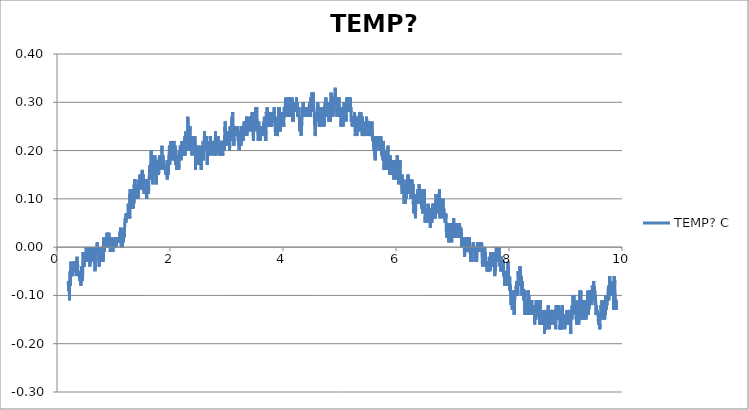
| Category | TEMP? C |
|---|---|
| 0.19886693011111112 | -0.07 |
| 0.20192682733333334 | -0.08 |
| 0.2049870023611111 | -0.09 |
| 0.20804745519444443 | -0.09 |
| 0.21110679683333333 | -0.09 |
| 0.21416724966666667 | -0.08 |
| 0.21722742469444445 | -0.07 |
| 0.22028732194444445 | -0.11 |
| 0.2233469413888889 | -0.08 |
| 0.22641044994444443 | -0.08 |
| 0.2294700693888889 | -0.06 |
| 0.23253246677777778 | -0.05 |
| 0.23559180841666666 | -0.08 |
| 0.23865226125 | -0.07 |
| 0.24171354744444443 | -0.07 |
| 0.24477511144444444 | -0.05 |
| 0.24783528647222222 | -0.03 |
| 0.2508951837222222 | -0.06 |
| 0.25395452536111107 | -0.06 |
| 0.2570135892222222 | -0.05 |
| 0.26007320866666667 | -0.05 |
| 0.2631325503333333 | -0.04 |
| 0.2661943921111111 | -0.05 |
| 0.2692537337777778 | -0.06 |
| 0.27231390880555556 | -0.06 |
| 0.27537352825 | -0.06 |
| 0.27843314769444444 | -0.05 |
| 0.2814924893333334 | -0.05 |
| 0.28455266438888893 | -0.04 |
| 0.2876125616111111 | -0.04 |
| 0.2906719032777778 | -0.04 |
| 0.2937318005 | -0.05 |
| 0.2967911421666667 | -0.05 |
| 0.29985048380555557 | -0.03 |
| 0.30291065883333335 | -0.05 |
| 0.30596972269444445 | -0.05 |
| 0.30902934213888894 | -0.04 |
| 0.31208951716666666 | -0.04 |
| 0.31514997 | -0.03 |
| 0.31820931163888894 | -0.03 |
| 0.32126948666666666 | -0.04 |
| 0.3243310506666667 | -0.05 |
| 0.32739039233333334 | -0.05 |
| 0.3304508451666667 | -0.04 |
| 0.33351018680555555 | -0.04 |
| 0.33657036183333333 | -0.05 |
| 0.33963025908333333 | -0.06 |
| 0.34269015630555555 | -0.04 |
| 0.3457494979722222 | -0.05 |
| 0.3488088396111111 | -0.05 |
| 0.3518684590555555 | -0.04 |
| 0.35493113425 | -0.02 |
| 0.3579918648611111 | -0.04 |
| 0.36105454002777776 | -0.03 |
| 0.3641138816944445 | -0.03 |
| 0.3671729455277778 | -0.04 |
| 0.37023423175 | -0.05 |
| 0.37329412897222225 | -0.05 |
| 0.3763543040277778 | -0.05 |
| 0.3794139234722222 | -0.05 |
| 0.3824732651111111 | -0.06 |
| 0.3855326067777778 | -0.06 |
| 0.3885922262222222 | -0.06 |
| 0.3916543458055555 | -0.06 |
| 0.3947172987777778 | -0.05 |
| 0.397777196 | -0.07 |
| 0.40083653766666666 | -0.07 |
| 0.40389671269444444 | -0.06 |
| 0.4069560543333333 | -0.07 |
| 0.41001595158333337 | -0.07 |
| 0.41307557102777775 | -0.05 |
| 0.4161349126666667 | -0.07 |
| 0.4191942543333333 | -0.07 |
| 0.42225359597222223 | -0.08 |
| 0.42531265983333333 | -0.08 |
| 0.4283728348611111 | -0.07 |
| 0.4314321765 | -0.05 |
| 0.4344929071388889 | -0.06 |
| 0.43755363774999995 | -0.04 |
| 0.44061325719444444 | -0.06 |
| 0.4436725988611111 | -0.05 |
| 0.4467333294722222 | -0.06 |
| 0.44979406008333334 | -0.07 |
| 0.45285673525 | -0.06 |
| 0.4559188548611111 | -0.05 |
| 0.45897847430555555 | -0.02 |
| 0.4620375381388889 | -0.01 |
| 0.4650977131944445 | -0.03 |
| 0.4681570548333333 | -0.04 |
| 0.4712166742777778 | -0.04 |
| 0.4742760159166667 | -0.03 |
| 0.47733702433333336 | -0.02 |
| 0.4803966437777778 | -0.04 |
| 0.4834557076388889 | -0.03 |
| 0.48651643827777774 | -0.03 |
| 0.48957605772222224 | -0.02 |
| 0.49263845508333337 | -0.03 |
| 0.49569779675000003 | -0.02 |
| 0.49875797177777775 | -0.02 |
| 0.501818424611111 | -0.02 |
| 0.5048774884444445 | -0.01 |
| 0.5079371078888889 | -0.03 |
| 0.5109967273333333 | -0.01 |
| 0.5140594025277777 | 0 |
| 0.5171195775555556 | 0 |
| 0.5201805859722223 | 0 |
| 0.5232404831944444 | 0 |
| 0.5263006582222222 | 0 |
| 0.5293650001666667 | -0.01 |
| 0.5324243418333333 | 0 |
| 0.5354839612777778 | 0 |
| 0.5385474698333333 | -0.03 |
| 0.5416334796666666 | -0.02 |
| 0.5446992105833334 | -0.02 |
| 0.5477854982222222 | -0.01 |
| 0.5508506735277778 | -0.03 |
| 0.5539430726388889 | -0.02 |
| 0.5570313048055556 | -0.01 |
| 0.5601245373055556 | 0 |
| 0.5631924905555555 | -0.02 |
| 0.5662665552777778 | -0.02 |
| 0.5693325639722222 | -0.01 |
| 0.5724041285277778 | -0.02 |
| 0.5755012501388889 | -0.02 |
| 0.5785925380555555 | -0.02 |
| 0.581674381 | -0.04 |
| 0.5847562239166666 | -0.02 |
| 0.5878377890833334 | 0 |
| 0.5909654679722222 | -0.02 |
| 0.5940453663333334 | -0.02 |
| 0.597158044388889 | -0.02 |
| 0.6002546103888888 | -0.02 |
| 0.6033367311111111 | -0.02 |
| 0.6063974617222222 | -0.01 |
| 0.6094598591111111 | -0.02 |
| 0.6125272567777778 | -0.02 |
| 0.6155924321111111 | -0.03 |
| 0.6186576074166666 | 0 |
| 0.6217266718611111 | -0.03 |
| 0.6248374053333334 | -0.03 |
| 0.6279003583055556 | -0.03 |
| 0.6309955353333333 | -0.03 |
| 0.6340801561944444 | -0.01 |
| 0.6371822780833333 | -0.02 |
| 0.6402649543888889 | -0.02 |
| 0.6433506864444444 | -0.02 |
| 0.6464211398333334 | -0.02 |
| 0.6494815926666667 | 0 |
| 0.6525448234444444 | 0 |
| 0.65563694475 | -0.01 |
| 0.6587329551388889 | -0.02 |
| 0.6618220207222223 | -0.02 |
| 0.664922753638889 | -0.02 |
| 0.6680304313888888 | -0.02 |
| 0.6711247750277778 | -0.02 |
| 0.6742055068055556 | -0.05 |
| 0.6773212405555556 | -0.02 |
| 0.6803928051388889 | -0.01 |
| 0.6834729813055554 | 0 |
| 0.6865473238333334 | 0 |
| 0.6896636131666667 | -0.01 |
| 0.6927585124166666 | -0.01 |
| 0.6958481335833334 | -0.01 |
| 0.6989230316666667 | 0 |
| 0.7020212644444443 | 0 |
| 0.7051172748611111 | -0.01 |
| 0.7082357865555555 | 0 |
| 0.7113220741944445 | 0.01 |
| 0.7144289185555556 | 0 |
| 0.717515484 | 0 |
| 0.720592326638889 | 0 |
| 0.7236666691388889 | -0.01 |
| 0.7267937924444444 | -0.01 |
| 0.7298784133333334 | -0.02 |
| 0.7329619230277777 | -0.02 |
| 0.7360540443333333 | -0.01 |
| 0.7391319981666667 | -0.02 |
| 0.7422268973888889 | -0.03 |
| 0.7453473536666667 | -0.01 |
| 0.7484591983055555 | -0.04 |
| 0.7515479860833333 | -0.02 |
| 0.75462010625 | 0 |
| 0.7576966711111112 | -0.02 |
| 0.7608229610277778 | -0.01 |
| 0.7639236939444445 | 0 |
| 0.7670022033611111 | -0.02 |
| 0.7701018250833334 | -0.01 |
| 0.773185057 | 0 |
| 0.7762805118333332 | -0.01 |
| 0.7793515208055556 | -0.02 |
| 0.7824464200555555 | -0.01 |
| 0.7855154844722222 | -0.02 |
| 0.7885989941666667 | -0.02 |
| 0.7917122278055556 | -0.02 |
| 0.7947790698888889 | -0.03 |
| 0.7978761914722222 | -0.02 |
| 0.8009730352777777 | -0.03 |
| 0.8040490445277778 | -0.01 |
| 0.8071425548055555 | -0.03 |
| 0.8102277312777778 | 0 |
| 0.8133287419722222 | -0.02 |
| 0.816398362 | -0.03 |
| 0.8195374304166666 | 0 |
| 0.8226112173333334 | 0 |
| 0.8257288956666666 | 0.02 |
| 0.8288093496388889 | 0.02 |
| 0.8318917481666667 | 0 |
| 0.8349780358055555 | 0 |
| 0.8380757129722223 | -0.01 |
| 0.8411572781111112 | 0 |
| 0.8442496772222222 | 0 |
| 0.8473142969444445 | 0 |
| 0.8504305863055556 | 0.01 |
| 0.8534943726388889 | 0 |
| 0.8565814936666667 | 0 |
| 0.859668336888889 | 0.02 |
| 0.8627351789722223 | 0.02 |
| 0.8658550796388889 | 0.01 |
| 0.8689772026666667 | 0.02 |
| 0.8720890473055556 | 0.02 |
| 0.8752347828055554 | 0.01 |
| 0.8783266263055556 | 0.02 |
| 0.8814123583611111 | 0.02 |
| 0.8845005905555556 | 0.03 |
| 0.8875957675833334 | 0.03 |
| 0.890686222111111 | 0.03 |
| 0.8938089007222223 | 0.02 |
| 0.8968807430833333 | 0.01 |
| 0.8999498075277778 | 0 |
| 0.9030394286944444 | 0.01 |
| 0.9061582181666666 | 0 |
| 0.9092264492222223 | 0.02 |
| 0.9123082921666668 | 0 |
| 0.9154143031388888 | 0.02 |
| 0.9184883678611111 | 0.03 |
| 0.9215885451944444 | 0 |
| 0.9246912226388888 | 0.02 |
| 0.9277980670277778 | 0 |
| 0.930886577 | 0.02 |
| 0.9339914768055555 | 0.01 |
| 0.9371174889444444 | 0.02 |
| 0.9402112770000001 | 0 |
| 0.9433014537500001 | -0.01 |
| 0.9463766296388889 | 0 |
| 0.9494776403611112 | 0 |
| 0.9525483715555556 | 0 |
| 0.955660494 | 0 |
| 0.9587395590000001 | 0 |
| 0.9618450143888889 | 0 |
| 0.9649507475833333 | 0.02 |
| 0.9680978720277779 | 0.01 |
| 0.9711733257222221 | 0 |
| 0.9742793366944444 | -0.01 |
| 0.9773822919722222 | 0 |
| 0.9804944144166667 | 0 |
| 0.9835754239722222 | 0 |
| 0.9866461551666666 | 0 |
| 0.9897507771666667 | -0.01 |
| 0.992830953361111 | 0.01 |
| 0.9959241858333333 | 0 |
| 0.9990243631388889 | 0.01 |
| 1.00214704175 | 0.01 |
| 1.0052249955833332 | 0 |
| 1.00830517175 | 0 |
| 1.0113995154166666 | 0 |
| 1.0144983037777777 | 0.01 |
| 1.017640705722222 | 0 |
| 1.0207289379166666 | 0.02 |
| 1.0238666173888888 | 0 |
| 1.0269320705 | 0 |
| 1.0300378036944444 | 0 |
| 1.033111035027778 | 0 |
| 1.0361870442777779 | 0 |
| 1.0392491638888888 | 0 |
| 1.0423451743055556 | 0.01 |
| 1.0454497963055556 | 0 |
| 1.0485480290833333 | 0 |
| 1.0516265384999999 | 0 |
| 1.0547056035 | 0 |
| 1.0577927245 | 0.01 |
| 1.0608792899444444 | 0.02 |
| 1.063965022 | 0.01 |
| 1.0670271415833332 | 0.02 |
| 1.0701225964166665 | 0.01 |
| 1.0732069394722223 | 0.02 |
| 1.0762746149444444 | 0.02 |
| 1.0793378457222222 | 0.01 |
| 1.0824399675833334 | 0.01 |
| 1.0855276441944444 | 0.01 |
| 1.0886089315277778 | 0.02 |
| 1.0916713289166666 | 0.02 |
| 1.0947462270277777 | 0.01 |
| 1.0978136246944443 | 0.02 |
| 1.1008932452777778 | 0.02 |
| 1.1039684211666667 | 0.01 |
| 1.1070508196944444 | 0.01 |
| 1.1101315514444443 | 0.01 |
| 1.1132233949722223 | 0.02 |
| 1.1163016265833334 | 0.03 |
| 1.119371246611111 | 0.01 |
| 1.1224542007222222 | 0.04 |
| 1.1255313211666667 | 0.03 |
| 1.12861094175 | 0.02 |
| 1.1316802839722222 | 0.02 |
| 1.1347565710277778 | 0.01 |
| 1.1378181350277776 | 0 |
| 1.140880254611111 | 0.02 |
| 1.1439593196111113 | 0.02 |
| 1.147035051111111 | 0.01 |
| 1.1501207831388889 | 0.01 |
| 1.1531845695 | 0.02 |
| 1.1562569674444445 | 0 |
| 1.1593379769999999 | 0.02 |
| 1.1624320428611112 | 0.01 |
| 1.1655238863888888 | 0.03 |
| 1.1686096184166668 | 0.01 |
| 1.1717100735555555 | 0.01 |
| 1.1747805269444445 | 0.01 |
| 1.1778790375 | 0.02 |
| 1.1809906043611111 | 0.03 |
| 1.1840630023055556 | 0.04 |
| 1.187181236222222 | 0.02 |
| 1.1902728019444446 | 0.03 |
| 1.193349922388889 | 0.03 |
| 1.1964442660277779 | 0.04 |
| 1.1995169417777778 | 0.05 |
| 1.202609340888889 | 0.05 |
| 1.205674794 | 0.05 |
| 1.2087869164444445 | 0.06 |
| 1.2118723706944443 | 0.05 |
| 1.2149878266666665 | 0.06 |
| 1.2180688362222223 | 0.05 |
| 1.221159846361111 | 0.05 |
| 1.2242277996111113 | 0.07 |
| 1.2273135316666668 | 0.06 |
| 1.230384540638889 | 0.06 |
| 1.2334727728333335 | 0.06 |
| 1.2365646163333335 | 0.06 |
| 1.2396409034166667 | 0.06 |
| 1.2427574705555555 | 0.07 |
| 1.2458301463055554 | 0.07 |
| 1.2489411575833334 | 0.07 |
| 1.2520318899166667 | 0.06 |
| 1.2551540129166667 | 0.07 |
| 1.2582291888333335 | 0.07 |
| 1.261331032888889 | 0.09 |
| 1.2644112090833333 | 0.08 |
| 1.2674958299444445 | 0.08 |
| 1.2705651721666666 | 0.07 |
| 1.2736620159722223 | 0.07 |
| 1.2767280246666666 | 0.06 |
| 1.2798040339444443 | 0.07 |
| 1.2829222678611112 | 0.08 |
| 1.2860082776944446 | 0.06 |
| 1.2890842869722223 | 0.11 |
| 1.2921594628611113 | 0.08 |
| 1.2952726964722223 | 0.12 |
| 1.298343149861111 | 0.09 |
| 1.3014672174444444 | 0.08 |
| 1.3045429489166667 | 0.09 |
| 1.3076245140833334 | 0.09 |
| 1.3107460815 | 0.1 |
| 1.3138470921944445 | 0.09 |
| 1.3169714375833335 | 0.12 |
| 1.320040502 | 0.1 |
| 1.3231429016666667 | 0.09 |
| 1.3262311338611112 | 0.08 |
| 1.3293377004444444 | 0.09 |
| 1.332435377611111 | 0.11 |
| 1.3355527781388887 | 0.11 |
| 1.3386176756666666 | 0.09 |
| 1.3417203531388888 | 0.11 |
| 1.344793584472222 | 0.08 |
| 1.3478798721111112 | 0.09 |
| 1.3509781048611111 | 0.1 |
| 1.3540666148611111 | 0.12 |
| 1.3571706812777777 | 0.11 |
| 1.3602366899722222 | 0.09 |
| 1.3633360339166665 | 0.11 |
| 1.3664256550833334 | 0.13 |
| 1.3694986086111112 | 0.11 |
| 1.3725937856666666 | 0.14 |
| 1.3756906294444444 | 0.12 |
| 1.3787710834166667 | 0.14 |
| 1.3818587600277779 | 0.1 |
| 1.3849650488055556 | 0.11 |
| 1.388047725138889 | 0.12 |
| 1.3911151228055556 | 0.11 |
| 1.394288359861111 | 0.13 |
| 1.3973793699722223 | 0.12 |
| 1.4004445453055556 | 0.11 |
| 1.4035316663055555 | 0.1 |
| 1.4066210096666667 | 0.11 |
| 1.4096884073611111 | 0.13 |
| 1.4127824731944445 | 0.12 |
| 1.4158532043888887 | 0.13 |
| 1.418921157638889 | 0.11 |
| 1.4220007782500002 | 0.11 |
| 1.425072065027778 | 0.12 |
| 1.4281464075277779 | 0.11 |
| 1.431253251888889 | 0.12 |
| 1.4343262054444443 | 0.11 |
| 1.4374024925000002 | 0.1 |
| 1.440478223972222 | 0.13 |
| 1.4435742343888889 | 0.12 |
| 1.4466644111388889 | 0.13 |
| 1.44974264275 | 0.14 |
| 1.452838375388889 | 0.13 |
| 1.455916607 | 0.12 |
| 1.4590467860277778 | 0.13 |
| 1.4621330736666667 | 0.13 |
| 1.465206305 | 0.15 |
| 1.4682934260277776 | 0.14 |
| 1.4713852695277778 | 0.14 |
| 1.4744832245000001 | 0.14 |
| 1.4775917356388888 | 0.12 |
| 1.4806799678333333 | 0.15 |
| 1.483746532111111 | 0.13 |
| 1.4868439315000002 | 0.15 |
| 1.4899341082500002 | 0.15 |
| 1.4930653984722222 | 0.13 |
| 1.4961619644722222 | 0.12 |
| 1.4992382515277778 | 0.12 |
| 1.5023100938888887 | 0.15 |
| 1.5054116601944445 | 0.14 |
| 1.5085021147222222 | 0.16 |
| 1.5115950694166669 | 0.15 |
| 1.5147141366944445 | 0.14 |
| 1.5178090359444445 | 0.13 |
| 1.5208731000833333 | 0.15 |
| 1.5239343862777777 | 0.15 |
| 1.5270276187777778 | 0.13 |
| 1.5301055725833335 | 0.15 |
| 1.5331907490555556 | 0.13 |
| 1.5362659249444444 | 0.13 |
| 1.5393522125833334 | 0.14 |
| 1.5424365556666668 | 0.11 |
| 1.5455278435833333 | 0.13 |
| 1.5486205204722223 | 0.14 |
| 1.5517145863333333 | 0.13 |
| 1.5547972626666668 | 0.14 |
| 1.557897717777778 | 0.14 |
| 1.5609987284722222 | 0.14 |
| 1.5641039060833333 | 0.14 |
| 1.5671899159166667 | 0.12 |
| 1.5702659251944444 | 0.13 |
| 1.5733561019444444 | 0.12 |
| 1.5764282220833332 | 0.12 |
| 1.5794978421111112 | 0.12 |
| 1.58257940725 | 0.12 |
| 1.5856448603611113 | 0.12 |
| 1.5887267033055557 | 0.1 |
| 1.5918143799166666 | 0.13 |
| 1.5949223354444444 | 0.12 |
| 1.5980005670833333 | 0.12 |
| 1.6011054668888889 | 0.14 |
| 1.604198699361111 | 0.11 |
| 1.6072860981666668 | 0.12 |
| 1.6103690522777778 | 0.11 |
| 1.6134550621388888 | 0.14 |
| 1.6165474612222221 | 0.14 |
| 1.6196565279444444 | 0.11 |
| 1.6227519827777777 | 0.12 |
| 1.6258838285833335 | 0.14 |
| 1.6290045626388887 | 0.14 |
| 1.6320983506944446 | 0.14 |
| 1.6352026949166667 | 0.15 |
| 1.6383017610555557 | 0.16 |
| 1.6414197171666667 | 0.16 |
| 1.6444871148333333 | 0.17 |
| 1.6475761804166666 | 0.16 |
| 1.6506596901111112 | 0.14 |
| 1.6537607008055557 | 0.14 |
| 1.6568328209722223 | 0.14 |
| 1.6599304981666667 | 0.17 |
| 1.6630278975277777 | 0.18 |
| 1.666146687027778 | 0.2 |
| 1.6692385305555555 | 0.17 |
| 1.672313428638889 | 0.16 |
| 1.6753886045277777 | 0.16 |
| 1.678481837 | 0.16 |
| 1.6815581240833333 | 0.16 |
| 1.68463830025 | 0.16 |
| 1.6877140317222223 | 0.14 |
| 1.69077892925 | 0.16 |
| 1.6938599388055557 | 0.15 |
| 1.6969259475 | 0.13 |
| 1.7000069570555554 | 0.15 |
| 1.7030707434166668 | 0.15 |
| 1.706159808972222 | 0.16 |
| 1.7092310957777777 | 0.17 |
| 1.7123112719444444 | 0.19 |
| 1.7153917259166667 | 0.19 |
| 1.7184599569722223 | 0.16 |
| 1.721522632138889 | 0.15 |
| 1.7245878074444443 | 0.16 |
| 1.7276524271944445 | 0.17 |
| 1.7307212138055554 | 0.19 |
| 1.733792778388889 | 0.19 |
| 1.7368604538611112 | 0.18 |
| 1.7399556308888888 | 0.16 |
| 1.7430208061944445 | 0.17 |
| 1.74610653825 | 0.17 |
| 1.7491969928055555 | 0.16 |
| 1.7522691129444443 | 0.16 |
| 1.7553515114722222 | 0.15 |
| 1.7584358545555556 | 0.13 |
| 1.7615124194166667 | 0.15 |
| 1.7645925955833335 | 0.18 |
| 1.7676633267777777 | 0.16 |
| 1.7707593371944443 | 0.17 |
| 1.7738392355833335 | 0.16 |
| 1.7769285789444444 | 0.18 |
| 1.7800070883611112 | 0.17 |
| 1.783071985888889 | 0.17 |
| 1.7861354944444443 | 0.15 |
| 1.7892012253611111 | 0.16 |
| 1.7922739010833333 | 0.16 |
| 1.7953504659444444 | 0.16 |
| 1.7984164746666667 | 0.15 |
| 1.8014963730277778 | 0.17 |
| 1.804564881888889 | 0.18 |
| 1.8076428356944443 | 0.18 |
| 1.8107169004166668 | 0.18 |
| 1.81378540925 | 0.19 |
| 1.8168614185277778 | 0.18 |
| 1.8199424280833334 | 0.16 |
| 1.823045383361111 | 0.16 |
| 1.8261122254166666 | 0.17 |
| 1.8291804564722223 | 0.18 |
| 1.8322798004166667 | 0.17 |
| 1.8353630323333332 | 0.18 |
| 1.8384720990277779 | 0.18 |
| 1.8415397745000002 | 0.19 |
| 1.8446002273333335 | 0.17 |
| 1.8476640136666667 | 0.18 |
| 1.8507525236666666 | 0.17 |
| 1.8538276995555556 | 0.18 |
| 1.856894541638889 | 0.21 |
| 1.8599713842777779 | 0.2 |
| 1.8630537828055556 | 0.18 |
| 1.8661431261666666 | 0.16 |
| 1.8692077459166667 | 0.18 |
| 1.8722773659166667 | 0.18 |
| 1.8753539307777778 | 0.19 |
| 1.8784602195555555 | 0.19 |
| 1.8815562299722224 | 0.18 |
| 1.8846269611666666 | 0.17 |
| 1.8877157489444443 | 0.17 |
| 1.8907931471944444 | 0.18 |
| 1.8938961024444443 | 0.16 |
| 1.897002669027778 | 0.17 |
| 1.90008951225 | 0.17 |
| 1.9031671882777779 | 0.17 |
| 1.9062429197500002 | 0.16 |
| 1.9093080950833334 | 0.17 |
| 1.9123896602222223 | 0.16 |
| 1.9154531687777778 | 0.16 |
| 1.9185450122777776 | 0.16 |
| 1.9216160212777778 | 0.16 |
| 1.9246953640555555 | 0.17 |
| 1.9277841518333334 | 0.15 |
| 1.9308807178333334 | 0.17 |
| 1.9339589494722222 | 0.16 |
| 1.9370544042777778 | 0.16 |
| 1.9401304135555557 | 0.17 |
| 1.943241702638889 | 0.16 |
| 1.9463266013055556 | 0.17 |
| 1.949412611138889 | 0.16 |
| 1.9524919539444443 | 0.14 |
| 1.9555671298333333 | 0.18 |
| 1.9586367498333335 | 0.16 |
| 1.9617166482222224 | 0.16 |
| 1.9647865460277778 | 0.18 |
| 1.967851999138889 | 0.16 |
| 1.970927175027778 | 0.15 |
| 1.9740087401666668 | 0.17 |
| 1.9770822493055558 | 0.18 |
| 1.9801527026944445 | 0.17 |
| 1.9832214893333333 | 0.19 |
| 1.9863250001944446 | 0.19 |
| 1.9894007316666666 | 0.21 |
| 1.9924734074166668 | 0.19 |
| 1.9955477499166667 | 0.17 |
| 1.9986232036111111 | 0.17 |
| 2.001713380361111 | 0.21 |
| 2.0048016125555557 | 0.19 |
| 2.0078862334166665 | 0.18 |
| 2.0109577979999997 | 0.2 |
| 2.0140332516666666 | 0.22 |
| 2.017102316111111 | 0.2 |
| 2.0202011044444443 | 0.2 |
| 2.023268502111111 | 0.19 |
| 2.026382569111111 | 0.2 |
| 2.0294613563333335 | 0.21 |
| 2.032544866027778 | 0.21 |
| 2.0356219864722225 | 0.22 |
| 2.038722719388889 | 0.22 |
| 2.0418051179166667 | 0.22 |
| 2.04487834925 | 0.2 |
| 2.0479404688333336 | 0.21 |
| 2.0510250896944444 | 0.2 |
| 2.0540958208888886 | 0.19 |
| 2.0571846086666667 | 0.18 |
| 2.0602761743888887 | 0.19 |
| 2.0633577395277776 | 0.18 |
| 2.0664345821944443 | 0.21 |
| 2.06950281325 | 0.22 |
| 2.072577989138889 | 0.21 |
| 2.0756414976944444 | 0.21 |
| 2.07873528575 | 0.2 |
| 2.081822128972222 | 0.19 |
| 2.0848859153333335 | 0.19 |
| 2.087960257833333 | 0.19 |
| 2.0910265443333333 | 0.21 |
| 2.094113943138889 | 0.18 |
| 2.097188007861111 | 0.2 |
| 2.1002873518055556 | 0.18 |
| 2.1033722504722223 | 0.17 |
| 2.1064477041388887 | 0.18 |
| 2.109523435611111 | 0.18 |
| 2.112586666388889 | 0.17 |
| 2.115672120638889 | 0.18 |
| 2.1187459075555557 | 0.16 |
| 2.121831639611111 | 0.17 |
| 2.1249045931388886 | 0.17 |
| 2.12798421375 | 0.18 |
| 2.1310621675555557 | 0.18 |
| 2.1341523443055554 | 0.19 |
| 2.137246687972222 | 0.19 |
| 2.140361032777778 | 0.19 |
| 2.143458987722222 | 0.18 |
| 2.146523051888889 | 0.19 |
| 2.149596283222222 | 0.19 |
| 2.1527070166944444 | 0.18 |
| 2.155771358638889 | 0.16 |
| 2.1588587574444444 | 0.17 |
| 2.161950045361111 | 0.2 |
| 2.16504744475 | 0.19 |
| 2.1681276209166667 | 0.18 |
| 2.1712241869166666 | 0.2 |
| 2.1742860287222223 | 0.2 |
| 2.1773712051944445 | 0.19 |
| 2.180441380777778 | 0.19 |
| 2.18352655725 | 0.21 |
| 2.1865986774166664 | 0.21 |
| 2.189699965888889 | 0.2 |
| 2.1927704193055555 | 0.21 |
| 2.195841428277778 | 0.2 |
| 2.1989235490277776 | 0.18 |
| 2.2020153925277777 | 0.19 |
| 2.205090290611111 | 0.19 |
| 2.208169633416667 | 0.2 |
| 2.2112439759166667 | 0.22 |
| 2.2143235965277777 | 0.19 |
| 2.2174043282777776 | 0.19 |
| 2.2204922826666667 | 0.21 |
| 2.2235616248888888 | 0.21 |
| 2.22664763475 | 0.21 |
| 2.2297317000277777 | 0.2 |
| 2.232809653861111 | 0.21 |
| 2.2358742735833332 | 0.19 |
| 2.238956672111111 | 0.2 |
| 2.2420221252222223 | 0.22 |
| 2.2450911896666668 | 0.2 |
| 2.2481580317222223 | 0.22 |
| 2.251232652027778 | 0.21 |
| 2.2543147727777777 | 0.22 |
| 2.25738105925 | 0.21 |
| 2.2604573463333333 | 0.22 |
| 2.2635302998611113 | 0.23 |
| 2.266604642361111 | 0.19 |
| 2.2696948191111113 | 0.21 |
| 2.2727724951666666 | 0.23 |
| 2.275835448111111 | 0.23 |
| 2.2789211801666664 | 0.23 |
| 2.2819846887222224 | 0.24 |
| 2.2850612535833332 | 0.24 |
| 2.2881322625833334 | 0.22 |
| 2.2911982712777776 | 0.22 |
| 2.294264002166667 | 0.2 |
| 2.2973625127222226 | 0.21 |
| 2.3004335217222223 | 0.2 |
| 2.3035148090833335 | 0.22 |
| 2.3066019300833336 | 0.21 |
| 2.309665994222222 | 0.22 |
| 2.3127342252777776 | 0.22 |
| 2.3158246798333333 | 0.27 |
| 2.3189101340833336 | 0.27 |
| 2.3219930881944446 | 0.23 |
| 2.3250635415833334 | 0.21 |
| 2.3281717749166666 | 0.21 |
| 2.3312350056944444 | 0.22 |
| 2.334300181 | 0.2 |
| 2.3373834129166666 | 0.22 |
| 2.3404744230277776 | 0.24 |
| 2.343560710666667 | 0.24 |
| 2.346642275833333 | 0.23 |
| 2.349716340527778 | 0.23 |
| 2.35279040525 | 0.25 |
| 2.3558747483333335 | 0.24 |
| 2.3589549245 | 0.22 |
| 2.362031489361111 | 0.23 |
| 2.365106109666667 | 0.23 |
| 2.3681748963055558 | 0.23 |
| 2.3712384048611113 | 0.22 |
| 2.374315803111111 | 0.22 |
| 2.3774045908888892 | 0.23 |
| 2.3804717107499997 | 0.21 |
| 2.383542441944445 | 0.2 |
| 2.3866098396111113 | 0.2 |
| 2.389689738 | 0.19 |
| 2.39279269325 | 0.19 |
| 2.395885092361111 | 0.22 |
| 2.398968046472222 | 0.22 |
| 2.4020598899722225 | 0.21 |
| 2.4051631230277777 | 0.21 |
| 2.4082296873055555 | 0.23 |
| 2.411326531111111 | 0.22 |
| 2.4144219859444447 | 0.21 |
| 2.4175196631111113 | 0.21 |
| 2.4205953945833336 | 0.21 |
| 2.423680848833333 | 0.22 |
| 2.4267610250277776 | 0.23 |
| 2.429846201472222 | 0.21 |
| 2.432918599444444 | 0.22 |
| 2.4360007201666667 | 0.21 |
| 2.439064506527778 | 0.23 |
| 2.4421369044722225 | 0.21 |
| 2.445218469611111 | 0.19 |
| 2.4482917009444445 | 0.21 |
| 2.451372432722222 | 0.16 |
| 2.4544587203333332 | 0.18 |
| 2.4575286181666667 | 0.2 |
| 2.4606421295833334 | 0.18 |
| 2.4637109162222224 | 0.19 |
| 2.466793314722222 | 0.2 |
| 2.4699079373333337 | 0.2 |
| 2.4729972806944445 | 0.2 |
| 2.476090235388889 | 0.2 |
| 2.4792006910555555 | 0.18 |
| 2.482281700611111 | 0.18 |
| 2.4853546541666667 | 0.2 |
| 2.488442052972222 | 0.19 |
| 2.491521673555556 | 0.21 |
| 2.4946196285277775 | 0.21 |
| 2.497694248833333 | 0.2 |
| 2.500762757666667 | 0.19 |
| 2.5038612682222223 | 0.2 |
| 2.5069294992777778 | 0.21 |
| 2.5099955079722225 | 0.17 |
| 2.513065128 | 0.2 |
| 2.516138914916667 | 0.19 |
| 2.5192340919444445 | 0.18 |
| 2.5223234353333335 | 0.18 |
| 2.5253983334166668 | 0.17 |
| 2.528473787111111 | 0.19 |
| 2.5315342399166667 | 0.2 |
| 2.5346016375833336 | 0.18 |
| 2.537677646861111 | 0.19 |
| 2.540761712138889 | 0.18 |
| 2.543851611111111 | 0.17 |
| 2.546930953888889 | 0.17 |
| 2.5500197416666666 | 0.18 |
| 2.5530957509444443 | 0.16 |
| 2.5561764827222224 | 0.18 |
| 2.559242769194445 | 0.19 |
| 2.5623162783333333 | 0.21 |
| 2.5653925653888887 | 0.2 |
| 2.568464963361111 | 0.2 |
| 2.5715548623055553 | 0.21 |
| 2.574622259972222 | 0.21 |
| 2.5777066030555553 | 0.2 |
| 2.5807845568888887 | 0.2 |
| 2.583858343805556 | 0.19 |
| 2.5869468537777776 | 0.18 |
| 2.5900125846944446 | 0.22 |
| 2.5931027614444444 | 0.19 |
| 2.5961809930555555 | 0.18 |
| 2.599263947166667 | 0.2 |
| 2.6023291224999996 | 0.2 |
| 2.605440133777778 | 0.21 |
| 2.6085105871666667 | 0.23 |
| 2.611595208027778 | 0.24 |
| 2.6146639946666665 | 0.21 |
| 2.617758616111111 | 0.22 |
| 2.6208379589166664 | 0.21 |
| 2.6239156349444444 | 0.22 |
| 2.627001367 | 0.21 |
| 2.6300893213888887 | 0.22 |
| 2.6331589414166667 | 0.22 |
| 2.6362530072777774 | 0.22 |
| 2.639313460111111 | 0.2 |
| 2.642395580833333 | 0.21 |
| 2.645461867333333 | 0.23 |
| 2.648534543083333 | 0.21 |
| 2.6516222196666663 | 0.2 |
| 2.6546837836666666 | 0.2 |
| 2.657769237944444 | 0.19 |
| 2.6608508030833335 | 0.17 |
| 2.663943479972222 | 0.21 |
| 2.6670233783611113 | 0.2 |
| 2.670114110694444 | 0.2 |
| 2.673199842722222 | 0.22 |
| 2.676292519638889 | 0.2 |
| 2.6793876966666668 | 0.21 |
| 2.6824753732777777 | 0.22 |
| 2.6855572161944443 | 0.2 |
| 2.688661838222222 | 0.21 |
| 2.6917753496388888 | 0.19 |
| 2.694850247722222 | 0.2 |
| 2.6979207011388886 | 0.21 |
| 2.700987821 | 0.2 |
| 2.7040607745555554 | 0.2 |
| 2.70714900675 | 0.2 |
| 2.710215293222222 | 0.21 |
| 2.713295747194444 | 0.23 |
| 2.716361755888889 | 0.23 |
| 2.719451099277778 | 0.2 |
| 2.7225284975000004 | 0.22 |
| 2.7256053401666667 | 0.22 |
| 2.7286766269444445 | 0.22 |
| 2.7317473581388887 | 0.2 |
| 2.73480808875 | 0.2 |
| 2.7379188222222224 | 0.22 |
| 2.741034833777778 | 0.21 |
| 2.7441433449166666 | 0.19 |
| 2.747219631972222 | 0.2 |
| 2.7502911965555557 | 0.2 |
| 2.7533897071111113 | 0.2 |
| 2.756494884722222 | 0.21 |
| 2.7596000623333334 | 0.21 |
| 2.762694405972222 | 0.21 |
| 2.765764303777778 | 0.2 |
| 2.7688450355555556 | 0.21 |
| 2.7719327121666666 | 0.21 |
| 2.7750340006388887 | 0.22 |
| 2.7781230662222223 | 0.22 |
| 2.7811943529999996 | 0.22 |
| 2.7842770293055557 | 0.2 |
| 2.7873616501944443 | 0.21 |
| 2.7904359926944444 | 0.21 |
| 2.7935606158611113 | 0.2 |
| 2.796669960388889 | 0.19 |
| 2.7997593037499997 | 0.21 |
| 2.802840591083333 | 0.21 |
| 2.8059238229999997 | 0.24 |
| 2.8090178888611113 | 0.22 |
| 2.8120822308055553 | 0.22 |
| 2.8151593512499997 | 0.19 |
| 2.8182378606666663 | 0.2 |
| 2.82132220375 | 0.21 |
| 2.824395990666667 | 0.2 |
| 2.827487556388889 | 0.21 |
| 2.830577455333333 | 0.21 |
| 2.833642352861111 | 0.21 |
| 2.8367197510833333 | 0.2 |
| 2.8398402073611115 | 0.2 |
| 2.842944273777778 | 0.21 |
| 2.846038895222222 | 0.2 |
| 2.8491129599444442 | 0.2 |
| 2.8522325828333335 | 0.21 |
| 2.855305536361111 | 0.23 |
| 2.85839349075 | 0.2 |
| 2.861468388861111 | 0.21 |
| 2.8645980123055557 | 0.2 |
| 2.867671243638889 | 0.22 |
| 2.8707528087777776 | 0.21 |
| 2.8738671535833333 | 0.2 |
| 2.8769628861944447 | 0.21 |
| 2.8800666748333335 | 0.22 |
| 2.88315462925 | 0.19 |
| 2.8862364721666665 | 0.2 |
| 2.88933026025 | 0.19 |
| 2.8924279374166666 | 0.22 |
| 2.895528948111111 | 0.21 |
| 2.898611902222222 | 0.22 |
| 2.901723191305556 | 0.22 |
| 2.9047947558611114 | 0.22 |
| 2.907884654833333 | 0.21 |
| 2.910947052194444 | 0.2 |
| 2.9140480629166667 | 0.21 |
| 2.917143795527778 | 0.2 |
| 2.9202231383333337 | 0.21 |
| 2.923334149611111 | 0.2 |
| 2.9264334935277776 | 0.19 |
| 2.9296003413333334 | 0.2 |
| 2.9326735726666664 | 0.19 |
| 2.935757360166667 | 0.19 |
| 2.9388847612777775 | 0.19 |
| 2.9419866053333332 | 0.22 |
| 2.9450806711944444 | 0.21 |
| 2.9481794595555555 | 0.21 |
| 2.951286026138889 | 0.22 |
| 2.9543725915555554 | 0.21 |
| 2.9574894365 | 0.22 |
| 2.9605829467777776 | 0.21 |
| 2.963699236138889 | 0.2 |
| 2.9667938575833332 | 0.23 |
| 2.969865144361111 | 0.23 |
| 2.972936431138889 | 0.25 |
| 2.9760171628888887 | 0.24 |
| 2.9790837271944444 | 0.26 |
| 2.9821630699722226 | 0.26 |
| 2.985249079805556 | 0.23 |
| 2.9883523128611107 | 0.23 |
| 2.9914224884722223 | 0.23 |
| 2.994539055611111 | 0.24 |
| 2.9976108979722222 | 0.23 |
| 3.0007027414999996 | 0.22 |
| 3.003789029138889 | 0.22 |
| 3.0068608715000003 | 0.22 |
| 3.009936602972222 | 0.21 |
| 3.0130248351666666 | 0.23 |
| 3.0161350130555555 | 0.22 |
| 3.0192338014166666 | 0.23 |
| 3.0223692585277777 | 0.22 |
| 3.025558885416667 | 0.23 |
| 3.028646006416667 | 0.24 |
| 3.0317181265833333 | 0.24 |
| 3.034796358194445 | 0.24 |
| 3.037865700416667 | 0.21 |
| 3.04094365425 | 0.22 |
| 3.044033553222222 | 0.21 |
| 3.0471345639166665 | 0.22 |
| 3.0502722433888887 | 0.23 |
| 3.053368809388889 | 0.2 |
| 3.0564948215 | 0.2 |
| 3.059591109722222 | 0.22 |
| 3.0626548960555557 | 0.25 |
| 3.065742294888889 | 0.24 |
| 3.0688274713333334 | 0.24 |
| 3.0718912576944444 | 0.23 |
| 3.0749694893055555 | 0.24 |
| 3.0780560547499998 | 0.24 |
| 3.0811492872222224 | 0.22 |
| 3.084241130722222 | 0.23 |
| 3.087318251166667 | 0.25 |
| 3.090425928916667 | 0.24 |
| 3.093496660111111 | 0.26 |
| 3.09656378 | 0.27 |
| 3.099644233972222 | 0.25 |
| 3.10274107775 | 0.25 |
| 3.105811253361111 | 0.25 |
| 3.1089111528888886 | 0.28 |
| 3.1119921624444444 | 0.27 |
| 3.115104840472222 | 0.27 |
| 3.1181805719444444 | 0.25 |
| 3.1212726932500003 | 0.24 |
| 3.1243464801666665 | 0.24 |
| 3.1274358235555555 | 0.22 |
| 3.130520722222222 | 0.21 |
| 3.1336175660000003 | 0.24 |
| 3.136706076 | 0.25 |
| 3.1398034753888893 | 0.24 |
| 3.1428789290555557 | 0.23 |
| 3.145951327027778 | 0.25 |
| 3.1490434483333334 | 0.25 |
| 3.152145014611111 | 0.23 |
| 3.1552529701388887 | 0.24 |
| 3.15831842325 | 0.25 |
| 3.161407766638889 | 0.25 |
| 3.164489609555556 | 0.24 |
| 3.167558951777778 | 0.25 |
| 3.170647739583333 | 0.25 |
| 3.173724304416667 | 0.24 |
| 3.1767944800277776 | 0.24 |
| 3.1799032689444444 | 0.24 |
| 3.1829837229166666 | 0.23 |
| 3.186068066 | 0.23 |
| 3.189137686027778 | 0.23 |
| 3.1922309185 | 0.24 |
| 3.195312205861111 | 0.23 |
| 3.198381270277778 | 0.25 |
| 3.201471447027778 | 0.24 |
| 3.2045469007222223 | 0.23 |
| 3.207630688194444 | 0.22 |
| 3.2107391993333336 | 0.23 |
| 3.213811041694444 | 0.23 |
| 3.2168970515555557 | 0.22 |
| 3.2199691716944447 | 0.21 |
| 3.2230485145000003 | 0.22 |
| 3.2261200790833335 | 0.2 |
| 3.229271926027778 | 0.22 |
| 3.2323434905833333 | 0.22 |
| 3.2354408899722222 | 0.23 |
| 3.2385077320555555 | 0.24 |
| 3.241600131138889 | 0.24 |
| 3.2446983639166667 | 0.22 |
| 3.247785762722222 | 0.23 |
| 3.2508778840277777 | 0.23 |
| 3.2539802836944443 | 0.22 |
| 3.257065182361111 | 0.21 |
| 3.2601675820277776 | 0.21 |
| 3.263269703916667 | 0.23 |
| 3.266339601722222 | 0.25 |
| 3.269411721888889 | 0.24 |
| 3.272492453638889 | 0.25 |
| 3.275603187111111 | 0.24 |
| 3.278714198388889 | 0.25 |
| 3.281791041055556 | 0.23 |
| 3.2849256647777776 | 0.24 |
| 3.2880233419722225 | 0.23 |
| 3.291133242055556 | 0.23 |
| 3.2942206408611114 | 0.22 |
| 3.297314984527778 | 0.24 |
| 3.3004162730277775 | 0.25 |
| 3.3035270065 | 0.25 |
| 3.306631072916667 | 0.24 |
| 3.30974875125 | 0.23 |
| 3.312843372694444 | 0.26 |
| 3.315993552888889 | 0.25 |
| 3.3191248430833338 | 0.25 |
| 3.3221944631111113 | 0.25 |
| 3.3253068633333336 | 0.23 |
| 3.3283762055555552 | 0.24 |
| 3.3314458255833332 | 0.26 |
| 3.33451794575 | 0.26 |
| 3.33760173325 | 0.26 |
| 3.3406763535277775 | 0.24 |
| 3.343762085583333 | 0.24 |
| 3.3468289276666665 | 0.23 |
| 3.3499079926666666 | 0.25 |
| 3.3529778904722223 | 0.24 |
| 3.3560477883055557 | 0.27 |
| 3.359113797 | 0.23 |
| 3.362215085472222 | 0.24 |
| 3.365298317388889 | 0.26 |
| 3.3683712709444444 | 0.26 |
| 3.371447558 | 0.26 |
| 3.374516066833333 | 0.27 |
| 3.3775937428611114 | 0.26 |
| 3.3806780859444445 | 0.26 |
| 3.3837838191388885 | 0.25 |
| 3.386858161666667 | 0.25 |
| 3.3899397268055553 | 0.25 |
| 3.3930165694444447 | 0.25 |
| 3.396097579 | 0.25 |
| 3.3991755328333335 | 0.25 |
| 3.402255431222222 | 0.25 |
| 3.4053394965000003 | 0.24 |
| 3.408452730138889 | 0.25 |
| 3.4115204055833335 | 0.25 |
| 3.4146197495277777 | 0.26 |
| 3.4176965921666667 | 0.25 |
| 3.4207623230833333 | 0.26 |
| 3.4238319431111113 | 0.25 |
| 3.4269448989166666 | 0.27 |
| 3.4300497987500003 | 0.27 |
| 3.4331208077222226 | 0.24 |
| 3.43619042775 | 0.24 |
| 3.439278104361111 | 0.26 |
| 3.4423752259444442 | 0.27 |
| 3.4454592912222224 | 0.26 |
| 3.4485300224166666 | 0.27 |
| 3.451597697888889 | 0.26 |
| 3.454661484222222 | 0.28 |
| 3.457763883888889 | 0.27 |
| 3.4608373930277776 | 0.27 |
| 3.463913957888889 | 0.27 |
| 3.4670016345000003 | 0.24 |
| 3.470066532 | 0.24 |
| 3.4731503195 | 0.24 |
| 3.476217439388889 | 0.22 |
| 3.479299004527778 | 0.25 |
| 3.482365846611111 | 0.27 |
| 3.4854312997222223 | 0.28 |
| 3.4885078645833336 | 0.26 |
| 3.4915947078055556 | 0.26 |
| 3.4946637722222222 | 0.26 |
| 3.497750059861111 | 0.27 |
| 3.5008110682777773 | 0.25 |
| 3.5039006894444444 | 0.24 |
| 3.5069853103055553 | 0.24 |
| 3.5100702089722224 | 0.27 |
| 3.513152051916667 | 0.28 |
| 3.5162236164999996 | 0.28 |
| 3.5193026815 | 0.27 |
| 3.5223664678333333 | 0.29 |
| 3.52544497725 | 0.28 |
| 3.528513486111111 | 0.29 |
| 3.5315858840555556 | 0.28 |
| 3.5346546706944446 | 0.29 |
| 3.537718734833333 | 0.28 |
| 3.5407889104444443 | 0.27 |
| 3.5438554747222226 | 0.26 |
| 3.546928150472222 | 0.26 |
| 3.5500030485555554 | 0.26 |
| 3.5530662793333336 | 0.24 |
| 3.556141733 | 0.23 |
| 3.5592210758055556 | 0.23 |
| 3.562284862166667 | 0.22 |
| 3.5653711498055554 | 0.23 |
| 3.568439103055556 | 0.23 |
| 3.5715087230555556 | 0.26 |
| 3.5745919549722225 | 0.22 |
| 3.5776674086666667 | 0.23 |
| 3.5807523073333334 | 0.23 |
| 3.5838458175833336 | 0.24 |
| 3.5869757188333335 | 0.23 |
| 3.590062562055556 | 0.24 |
| 3.593176629055556 | 0.23 |
| 3.5962470824722224 | 0.22 |
| 3.5993267030555556 | 0.23 |
| 3.6023929895555558 | 0.23 |
| 3.60548455525 | 0.23 |
| 3.6085516751388886 | 0.24 |
| 3.611647963333333 | 0.24 |
| 3.6147448071388886 | 0.25 |
| 3.61784526225 | 0.24 |
| 3.620922104888889 | 0.24 |
| 3.62399866975 | 0.24 |
| 3.627078568138889 | 0.25 |
| 3.6301420766944448 | 0.25 |
| 3.633214196861111 | 0.25 |
| 3.6362843724722222 | 0.24 |
| 3.6393559370277777 | 0.24 |
| 3.64244278025 | 0.23 |
| 3.645517956138889 | 0.23 |
| 3.6485959099722223 | 0.23 |
| 3.6516669189722224 | 0.24 |
| 3.6548029316666666 | 0.24 |
| 3.6578831078333334 | 0.25 |
| 3.6610085643888888 | 0.26 |
| 3.6640937408333336 | 0.25 |
| 3.6672030853611113 | 0.26 |
| 3.67026548275 | 0.27 |
| 3.6733434365555553 | 0.27 |
| 3.6764194458333335 | 0.27 |
| 3.679506289055556 | 0.27 |
| 3.6825775758333332 | 0.25 |
| 3.6856624745 | 0.24 |
| 3.6887720968055557 | 0.23 |
| 3.6918356053611108 | 0.25 |
| 3.6949063365555554 | 0.22 |
| 3.6979773455555556 | 0.26 |
| 3.701061688611111 | 0.27 |
| 3.704155754472222 | 0.28 |
| 3.7072359306666667 | 0.28 |
| 3.710329163138889 | 0.27 |
| 3.7133973941944447 | 0.28 |
| 3.7164717366944444 | 0.28 |
| 3.7195405233333334 | 0.29 |
| 3.722614588055556 | 0.28 |
| 3.7256825413055554 | 0.27 |
| 3.7287588283611113 | 0.26 |
| 3.731824559277778 | 0.26 |
| 3.734889734583333 | 0.27 |
| 3.7379685218055556 | 0.25 |
| 3.7410367528333333 | 0.27 |
| 3.7441183180000004 | 0.27 |
| 3.747195994027778 | 0.25 |
| 3.750268391972222 | 0.28 |
| 3.753343567861111 | 0.28 |
| 3.7564379115277777 | 0.27 |
| 3.7595130874166665 | 0.27 |
| 3.7625813184444445 | 0.27 |
| 3.7656484383333333 | 0.25 |
| 3.7687261143611113 | 0.27 |
| 3.7718024014166667 | 0.25 |
| 3.7748720214444442 | 0.28 |
| 3.7779391413055556 | 0.26 |
| 3.781004872222222 | 0.26 |
| 3.784076992388889 | 0.25 |
| 3.787140778722222 | 0.26 |
| 3.7902045650833336 | 0.26 |
| 3.7932747406944443 | 0.27 |
| 3.796367973166667 | 0.27 |
| 3.7994398155277778 | 0.25 |
| 3.8025183249444443 | 0.26 |
| 3.8055954453888887 | 0.27 |
| 3.8086661765833334 | 0.26 |
| 3.8117616314166667 | 0.27 |
| 3.814842640972222 | 0.28 |
| 3.817960319277778 | 0.26 |
| 3.821069386 | 0.26 |
| 3.824158729361111 | 0.26 |
| 3.8272427946666667 | 0.26 |
| 3.830320192888889 | 0.26 |
| 3.833405369361111 | 0.26 |
| 3.83649804625 | 0.26 |
| 3.8395687774444442 | 0.28 |
| 3.8426445089166665 | 0.28 |
| 3.8457107954166667 | 0.29 |
| 3.8487959718888884 | 0.27 |
| 3.8519008716944443 | 0.27 |
| 3.854967435972222 | 0.26 |
| 3.8580453898055556 | 0.26 |
| 3.8611639015000003 | 0.25 |
| 3.864248522388889 | 0.24 |
| 3.867315086666667 | 0.24 |
| 3.8703780396388887 | 0.25 |
| 3.873440437027778 | 0.23 |
| 3.8765283914166666 | 0.23 |
| 3.8796119011111108 | 0.25 |
| 3.882676798638889 | 0.27 |
| 3.8857469742500004 | 0.27 |
| 3.8888207611666665 | 0.25 |
| 3.8918903811666667 | 0.25 |
| 3.8949750020555554 | 0.25 |
| 3.898060734111111 | 0.25 |
| 3.9011350766111113 | 0.23 |
| 3.9042155305833335 | 0.24 |
| 3.907290984277778 | 0.24 |
| 3.9103694936666664 | 0.26 |
| 3.913445225166667 | 0.25 |
| 3.9165265125 | 0.26 |
| 3.919614189111111 | 0.26 |
| 3.922691865138889 | 0.26 |
| 3.92577481925 | 0.29 |
| 3.928883330388889 | 0.27 |
| 3.9319507280555555 | 0.29 |
| 3.935042571555556 | 0.26 |
| 3.9381263590555555 | 0.26 |
| 3.9412054240555556 | 0.24 |
| 3.9442925450833335 | 0.26 |
| 3.9473624428888887 | 0.26 |
| 3.950429840555555 | 0.24 |
| 3.9535052942499997 | 0.27 |
| 3.956571580722222 | 0.27 |
| 3.9596520346944444 | 0.28 |
| 3.9627263772222223 | 0.27 |
| 3.965788774583334 | 0.26 |
| 3.9688589501944445 | 0.27 |
| 3.971937737416667 | 0.27 |
| 3.975004023888889 | 0.27 |
| 3.9780961451944443 | 0.27 |
| 3.9811635428611107 | 0.26 |
| 3.9842287181944442 | 0.26 |
| 3.9872958380555557 | 0.25 |
| 3.990371013944445 | 0.26 |
| 3.993448967777778 | 0.28 |
| 3.9965213657222223 | 0.26 |
| 3.9995970971944446 | 0.26 |
| 4.0026708841388885 | 0.27 |
| 4.005774394972222 | 0.26 |
| 4.008851237611111 | 0.27 |
| 4.01192002425 | 0.25 |
| 4.014988255305556 | 0.26 |
| 4.018056208555556 | 0.28 |
| 4.021153330138889 | 0.27 |
| 4.024235450888889 | 0.29 |
| 4.027301737388889 | 0.28 |
| 4.030378302222222 | 0.27 |
| 4.033461811944444 | 0.27 |
| 4.036545599416667 | 0.28 |
| 4.039617719583333 | 0.28 |
| 4.042700118111111 | 0.3 |
| 4.045765849027778 | 0.29 |
| 4.048882138361111 | 0.29 |
| 4.051964814694444 | 0.31 |
| 4.05505860275 | 0.3 |
| 4.058127667194444 | 0.3 |
| 4.061208676750001 | 0.27 |
| 4.064296908944444 | 0.28 |
| 4.067385141138889 | 0.28 |
| 4.070457261277777 | 0.27 |
| 4.073529103666666 | 0.27 |
| 4.076602612777777 | 0.29 |
| 4.079673899555556 | 0.29 |
| 4.082742686194444 | 0.28 |
| 4.0858070281388885 | 0.29 |
| 4.088886370916667 | 0.27 |
| 4.09195960225 | 0.27 |
| 4.095030333444445 | 0.28 |
| 4.098103009194444 | 0.27 |
| 4.1011917969722225 | 0.29 |
| 4.104266972861111 | 0.31 |
| 4.107350760361111 | 0.29 |
| 4.1104364924166665 | 0.3 |
| 4.11351444625 | 0.31 |
| 4.116574899055555 | 0.29 |
| 4.119678132111111 | 0.29 |
| 4.122749974472223 | 0.28 |
| 4.1258501518055555 | 0.28 |
| 4.128923383138889 | 0.29 |
| 4.132016893416667 | 0.28 |
| 4.135086235638889 | 0.28 |
| 4.138161411527777 | 0.29 |
| 4.141232142722222 | 0.27 |
| 4.144313985638889 | 0.3 |
| 4.1473824944999995 | 0.28 |
| 4.150457948166667 | 0.29 |
| 4.153561181222223 | 0.29 |
| 4.156695249361111 | 0.29 |
| 4.159768480694445 | 0.29 |
| 4.162868935833333 | 0.31 |
| 4.165947723027778 | 0.3 |
| 4.169025954638889 | 0.28 |
| 4.172107242 | 0.26 |
| 4.175180751138889 | 0.28 |
| 4.178252871277778 | 0.26 |
| 4.181335547611111 | 0.27 |
| 4.184404612027778 | 0.3 |
| 4.187481176888888 | 0.29 |
| 4.190554963805556 | 0.3 |
| 4.193638473527778 | 0.29 |
| 4.196713093805555 | 0.3 |
| 4.199821604944445 | 0.29 |
| 4.20289150275 | 0.3 |
| 4.205967789833333 | 0.3 |
| 4.2090476881944445 | 0.29 |
| 4.212122030722222 | 0.28 |
| 4.215207207166666 | 0.28 |
| 4.218289605694444 | 0.29 |
| 4.221371170833334 | 0.29 |
| 4.224489960333333 | 0.28 |
| 4.227564580638889 | 0.3 |
| 4.230648645944445 | 0.29 |
| 4.233725766388889 | 0.3 |
| 4.2368131651944445 | 0.28 |
| 4.239891952388889 | 0.31 |
| 4.242960739027778 | 0.28 |
| 4.246073694861111 | 0.29 |
| 4.2491544266388885 | 0.29 |
| 4.252225991194445 | 0.3 |
| 4.255292833277778 | 0.29 |
| 4.258398566472222 | 0.27 |
| 4.261491798944444 | 0.29 |
| 4.264600865666667 | 0.28 |
| 4.267672708027778 | 0.29 |
| 4.2707484395 | 0.27 |
| 4.273839449638889 | 0.28 |
| 4.276915736694445 | 0.28 |
| 4.280005913444445 | 0.29 |
| 4.283076089055555 | 0.29 |
| 4.286185711361111 | 0.28 |
| 4.289260053861112 | 0.28 |
| 4.292329673888889 | 0.28 |
| 4.295418739472223 | 0.24 |
| 4.298510027388889 | 0.26 |
| 4.301575202694444 | 0.27 |
| 4.3046762133888885 | 0.25 |
| 4.307768890305556 | 0.24 |
| 4.310874067888889 | 0.25 |
| 4.313957577611111 | 0.26 |
| 4.317049698888889 | 0.25 |
| 4.320120430083334 | 0.26 |
| 4.323193661416666 | 0.23 |
| 4.326268559527778 | 0.26 |
| 4.329333457055555 | 0.25 |
| 4.332395854416666 | 0.26 |
| 4.335459640777778 | 0.26 |
| 4.338528983 | 0.27 |
| 4.341608047999999 | 0.27 |
| 4.34467600125 | 0.27 |
| 4.347758677583333 | 0.28 |
| 4.350844965222222 | 0.29 |
| 4.353934864166667 | 0.27 |
| 4.357016429305555 | 0.3 |
| 4.360081882416667 | 0.29 |
| 4.363161225222222 | 0.27 |
| 4.366235289944445 | 0.27 |
| 4.369343523277777 | 0.29 |
| 4.372439533694444 | 0.27 |
| 4.3755174875 | 0.28 |
| 4.378607942055556 | 0.28 |
| 4.381703119083333 | 0.29 |
| 4.384808018888889 | 0.27 |
| 4.387908196222223 | 0.28 |
| 4.391013373833333 | 0.27 |
| 4.394103272777778 | 0.28 |
| 4.397199838777778 | 0.27 |
| 4.400294738027778 | 0.28 |
| 4.403372691861112 | 0.27 |
| 4.406445089805556 | 0.28 |
| 4.409569157388889 | 0.29 |
| 4.412649333555556 | 0.28 |
| 4.4157500664722225 | 0.28 |
| 4.418824131166667 | 0.27 |
| 4.421929031 | 0.28 |
| 4.425019485527778 | 0.27 |
| 4.428131052388888 | 0.27 |
| 4.431215673277777 | 0.27 |
| 4.434305016638889 | 0.28 |
| 4.43740074925 | 0.29 |
| 4.440483425583333 | 0.29 |
| 4.443562768361111 | 0.29 |
| 4.446633777361111 | 0.29 |
| 4.449700341638889 | 0.29 |
| 4.4527852403055554 | 0.28 |
| 4.455900140694444 | 0.29 |
| 4.459006151666667 | 0.27 |
| 4.462071326999999 | 0.28 |
| 4.465170948722222 | 0.29 |
| 4.468255569611111 | 0.3 |
| 4.471341579444444 | 0.3 |
| 4.474427033694444 | 0.27 |
| 4.47751276575 | 0.29 |
| 4.480592386333333 | 0.27 |
| 4.48366617325 | 0.28 |
| 4.486778295722222 | 0.29 |
| 4.489850138083334 | 0.3 |
| 4.492916702361111 | 0.31 |
| 4.495999934277777 | 0.3 |
| 4.499122335083333 | 0.29 |
| 4.502216956527778 | 0.3 |
| 4.505281298472222 | 0.28 |
| 4.508361752444444 | 0.3 |
| 4.511448040083333 | 0.29 |
| 4.514540439166667 | 0.32 |
| 4.517621448722222 | 0.3 |
| 4.520717459138889 | 0.3 |
| 4.523822358944444 | 0.32 |
| 4.526891145583333 | 0.3 |
| 4.529991045111111 | 0.3 |
| 4.533070665694444 | 0.32 |
| 4.536177787861111 | 0.31 |
| 4.539269075777778 | 0.3 |
| 4.542368141944444 | 0.3 |
| 4.545456651916666 | 0.29 |
| 4.548547939833333 | 0.29 |
| 4.55162644925 | 0.28 |
| 4.554706903222223 | 0.28 |
| 4.557802635861111 | 0.26 |
| 4.560863366472222 | 0.25 |
| 4.563929097361111 | 0.25 |
| 4.567001495333333 | 0.25 |
| 4.5700811159166665 | 0.23 |
| 4.573164070027778 | 0.24 |
| 4.576255635750001 | 0.25 |
| 4.579349423805556 | 0.27 |
| 4.582433766888889 | 0.27 |
| 4.585540889055555 | 0.27 |
| 4.588625787722222 | 0.26 |
| 4.591704574916666 | 0.27 |
| 4.594776417305556 | 0.26 |
| 4.59785353775 | 0.26 |
| 4.60094454786111 | 0.28 |
| 4.60406417075 | 0.28 |
| 4.607156569833333 | 0.27 |
| 4.610228412222223 | 0.28 |
| 4.6133363677500006 | 0.29 |
| 4.616421822 | 0.3 |
| 4.619492553194444 | 0.28 |
| 4.622556617333333 | 0.28 |
| 4.625655127888889 | 0.29 |
| 4.628750304944444 | 0.28 |
| 4.631817980388889 | 0.27 |
| 4.634933714166666 | 0.26 |
| 4.638003889777778 | 0.26 |
| 4.641126012777778 | 0.25 |
| 4.644195910583333 | 0.25 |
| 4.647266364 | 0.26 |
| 4.650355985138888 | 0.26 |
| 4.653427549722222 | 0.25 |
| 4.656502447833333 | 0.25 |
| 4.659562067277778 | 0.26 |
| 4.66265529975 | 0.25 |
| 4.66572964225 | 0.26 |
| 4.668803706972223 | 0.26 |
| 4.671882216388888 | 0.26 |
| 4.6750387858055555 | 0.26 |
| 4.678162575611111 | 0.28 |
| 4.681306366527778 | 0.27 |
| 4.684404877083333 | 0.27 |
| 4.687510332472223 | 0.25 |
| 4.690622454916666 | 0.29 |
| 4.693687908027778 | 0.27 |
| 4.696789752111111 | 0.28 |
| 4.6998629834444445 | 0.26 |
| 4.702967605472222 | 0.26 |
| 4.706060004583334 | 0.29 |
| 4.709192128166667 | 0.29 |
| 4.712270637583333 | 0.28 |
| 4.715343035527778 | 0.28 |
| 4.718431545527777 | 0.28 |
| 4.7215014433333335 | 0.27 |
| 4.724598287138889 | 0.26 |
| 4.727715132055556 | 0.25 |
| 4.730779196222222 | 0.27 |
| 4.733858816805555 | 0.28 |
| 4.7369287146111105 | 0.28 |
| 4.74000555725 | 0.28 |
| 4.743075455083333 | 0.27 |
| 4.746176187972223 | 0.3 |
| 4.749247752555556 | 0.29 |
| 4.752375431444444 | 0.29 |
| 4.755471441861111 | 0.3 |
| 4.758538283944445 | 0.31 |
| 4.761636238916666 | 0.31 |
| 4.764740027555556 | 0.3 |
| 4.7678185369722215 | 0.29 |
| 4.7708831566944445 | 0.27 |
| 4.773944442888889 | 0.29 |
| 4.777020452166667 | 0.28 |
| 4.780102295111111 | 0.29 |
| 4.783199138888889 | 0.3 |
| 4.786273759194444 | 0.29 |
| 4.7893781034166665 | 0.27 |
| 4.792480503111111 | 0.27 |
| 4.795574013361111 | 0.27 |
| 4.798654467333334 | 0.27 |
| 4.801767423166667 | 0.28 |
| 4.804857599916667 | 0.3 |
| 4.807925275388889 | 0.28 |
| 4.810994895388889 | 0.26 |
| 4.814085627722223 | 0.29 |
| 4.817161359194444 | 0.3 |
| 4.820247924638888 | 0.28 |
| 4.823317266861111 | 0.29 |
| 4.826383553361111 | 0.29 |
| 4.8294842862500005 | 0.27 |
| 4.832584463583333 | 0.27 |
| 4.835725476583334 | 0.26 |
| 4.838792596444445 | 0.27 |
| 4.841892218166667 | 0.28 |
| 4.844986561833334 | 0.3 |
| 4.848060070944445 | 0.3 |
| 4.8511363580277775 | 0.32 |
| 4.854226534777778 | 0.3 |
| 4.85731754488889 | 0.29 |
| 4.860414110888889 | 0.28 |
| 4.863503176472222 | 0.29 |
| 4.866575574416666 | 0.27 |
| 4.86966630675 | 0.3 |
| 4.872739815888889 | 0.28 |
| 4.875821103250001 | 0.27 |
| 4.878889889888889 | 0.28 |
| 4.882007012611111 | 0.27 |
| 4.885075799250001 | 0.28 |
| 4.888171809666667 | 0.29 |
| 4.891253097 | 0.28 |
| 4.894331606416667 | 0.3 |
| 4.897399837472222 | 0.29 |
| 4.900473346611111 | 0.3 |
| 4.903539910888889 | 0.31 |
| 4.906605919583333 | 0.3 |
| 4.909718597611111 | 0.3 |
| 4.912802385111111 | 0.31 |
| 4.9159617325 | 0.31 |
| 4.919043575416667 | 0.31 |
| 4.922170698722223 | 0.31 |
| 4.92523559625 | 0.33 |
| 4.928354941333334 | 0.32 |
| 4.931446784861111 | 0.32 |
| 4.934516682666667 | 0.29 |
| 4.937596025444444 | 0.31 |
| 4.940658700638889 | 0.31 |
| 4.943753044277777 | 0.3 |
| 4.946834053833333 | 0.29 |
| 4.949948676416667 | 0.29 |
| 4.953013018361111 | 0.31 |
| 4.956085416333333 | 0.27 |
| 4.959159758833334 | 0.29 |
| 4.962244657499999 | 0.28 |
| 4.965326222638889 | 0.29 |
| 4.968417232777778 | 0.29 |
| 4.971485186027778 | 0.28 |
| 4.974580085277777 | 0.29 |
| 4.977648038527778 | 0.29 |
| 4.98072377 | 0.31 |
| 4.983830892166666 | 0.29 |
| 4.986947459305555 | 0.29 |
| 4.990058748361111 | 0.31 |
| 4.993126423833333 | 0.3 |
| 4.996225212194444 | 0.28 |
| 4.999289276333333 | 0.27 |
| 5.002387509083333 | 0.29 |
| 5.005482963916666 | 0.27 |
| 5.008580918888889 | 0.29 |
| 5.011650261111111 | 0.29 |
| 5.0147257148055555 | 0.29 |
| 5.017804224222222 | 0.28 |
| 5.020955237777778 | 0.27 |
| 5.024028746888889 | 0.28 |
| 5.0271178124722224 | 0.25 |
| 5.030192988361111 | 0.26 |
| 5.033278164833334 | 0.26 |
| 5.036344451305555 | 0.25 |
| 5.039422682944444 | 0.25 |
| 5.042490636194444 | 0.26 |
| 5.045557756055556 | 0.27 |
| 5.048633765333333 | 0.28 |
| 5.051724497666666 | 0.29 |
| 5.054799673555555 | 0.28 |
| 5.057871238138889 | 0.27 |
| 5.0609389136111105 | 0.26 |
| 5.064024923444444 | 0.26 |
| 5.067103155055555 | 0.25 |
| 5.070177219777778 | 0.28 |
| 5.073245728611111 | 0.28 |
| 5.07632396025 | 0.28 |
| 5.079404414194444 | 0.28 |
| 5.082486812722222 | 0.3 |
| 5.0855583773055555 | 0.28 |
| 5.0886254971666665 | 0.29 |
| 5.091718729666667 | 0.3 |
| 5.094789183055555 | 0.28 |
| 5.097868803638889 | 0.29 |
| 5.100937034694445 | 0.29 |
| 5.104008321472222 | 0.27 |
| 5.107089053222222 | 0.28 |
| 5.110187841583333 | 0.28 |
| 5.113248294416667 | 0.27 |
| 5.116337915583333 | 0.26 |
| 5.1194078133888885 | 0.27 |
| 5.122503823805556 | 0.28 |
| 5.125590389222222 | 0.3 |
| 5.128673343333333 | 0.31 |
| 5.1317632423055555 | 0.31 |
| 5.134838973777778 | 0.3 |
| 5.137916371999999 | 0.31 |
| 5.141002937444445 | 0.29 |
| 5.144074779805556 | 0.29 |
| 5.147140510722222 | 0.31 |
| 5.150213742055556 | 0.28 |
| 5.153279472944444 | 0.3 |
| 5.156343537083333 | 0.29 |
| 5.159424268861111 | 0.3 |
| 5.162494166666667 | 0.3 |
| 5.165566009027778 | 0.28 |
| 5.168670631055555 | 0.29 |
| 5.171769697194445 | 0.29 |
| 5.174847928833333 | 0.29 |
| 5.177918937805556 | 0.3 |
| 5.181008836749999 | 0.3 |
| 5.184089846305556 | 0.28 |
| 5.187163911027778 | 0.31 |
| 5.190243531611111 | 0.31 |
| 5.193314818388889 | 0.3 |
| 5.196399717055556 | 0.28 |
| 5.199467114722222 | 0.29 |
| 5.202536734750001 | 0.28 |
| 5.205626633694444 | 0.27 |
| 5.208691253444444 | 0.26 |
| 5.211771151805555 | 0.27 |
| 5.214845494333333 | 0.26 |
| 5.217916503305555 | 0.27 |
| 5.220988901277778 | 0.26 |
| 5.224071299805555 | 0.25 |
| 5.2271681435833335 | 0.25 |
| 5.230248319749999 | 0.26 |
| 5.233325718000001 | 0.26 |
| 5.2364028384444445 | 0.26 |
| 5.239485792555556 | 0.25 |
| 5.2425540236111114 | 0.26 |
| 5.2456469783055555 | 0.27 |
| 5.248710486861111 | 0.25 |
| 5.251792607583333 | 0.27 |
| 5.254853893777778 | 0.25 |
| 5.257937959083334 | 0.27 |
| 5.261000356444445 | 0.27 |
| 5.264077199111111 | 0.27 |
| 5.267146263527778 | 0.28 |
| 5.2702569970277775 | 0.26 |
| 5.273323005722222 | 0.26 |
| 5.276428183333333 | 0.26 |
| 5.279502525833334 | 0.23 |
| 5.282579368472222 | 0.24 |
| 5.285678434638889 | 0.25 |
| 5.288754166111111 | 0.26 |
| 5.2918223971666665 | 0.25 |
| 5.29488451675 | 0.25 |
| 5.297973304527778 | 0.23 |
| 5.301047647027778 | 0.24 |
| 5.304115600277777 | 0.25 |
| 5.307183831333333 | 0.23 |
| 5.310259007222222 | 0.25 |
| 5.313326404888889 | 0.27 |
| 5.316410470166667 | 0.25 |
| 5.319496480027778 | 0.25 |
| 5.3225736004722215 | 0.26 |
| 5.3256571101666665 | 0.24 |
| 5.328730619305556 | 0.24 |
| 5.331808017527778 | 0.24 |
| 5.334874304027777 | 0.26 |
| 5.337942535083333 | 0.25 |
| 5.341004932444444 | 0.27 |
| 5.344087330972223 | 0.26 |
| 5.347153339694445 | 0.25 |
| 5.350221848527778 | 0.25 |
| 5.353291468527777 | 0.26 |
| 5.356361644138889 | 0.25 |
| 5.359442098111112 | 0.28 |
| 5.362505884472221 | 0.25 |
| 5.365586060638889 | 0.24 |
| 5.36867123711111 | 0.25 |
| 5.371750302111112 | 0.27 |
| 5.374817144194445 | 0.27 |
| 5.3778834306666665 | 0.28 |
| 5.380954717444445 | 0.27 |
| 5.384060172861111 | 0.25 |
| 5.387129792861111 | 0.25 |
| 5.390212746972222 | 0.27 |
| 5.393288478472222 | 0.26 |
| 5.396375043888889 | 0.26 |
| 5.399439108027778 | 0.24 |
| 5.402527062444444 | 0.23 |
| 5.405598904805555 | 0.27 |
| 5.408681581111111 | 0.26 |
| 5.411752590111111 | 0.25 |
| 5.414846655972222 | 0.25 |
| 5.417915164805556 | 0.23 |
| 5.420989785111112 | 0.24 |
| 5.424052738083334 | 0.24 |
| 5.427145137166667 | 0.25 |
| 5.430217812916666 | 0.25 |
| 5.433292155416667 | 0.25 |
| 5.436372053805555 | 0.23 |
| 5.439457508055556 | 0.23 |
| 5.442549907166666 | 0.25 |
| 5.445638417138889 | 0.24 |
| 5.4487022035 | 0.25 |
| 5.451782101888888 | 0.24 |
| 5.454843943666667 | 0.24 |
| 5.457915786055555 | 0.24 |
| 5.4609865172222225 | 0.24 |
| 5.464059470777777 | 0.26 |
| 5.4671257572777785 | 0.25 |
| 5.470200377583334 | 0.25 |
| 5.473263052749999 | 0.26 |
| 5.476327116888889 | 0.25 |
| 5.479398681472222 | 0.27 |
| 5.482459967666667 | 0.25 |
| 5.485542366194444 | 0.26 |
| 5.488607819305556 | 0.26 |
| 5.4916863287222215 | 0.23 |
| 5.494765115916667 | 0.24 |
| 5.4978469588611105 | 0.26 |
| 5.500928801805555 | 0.26 |
| 5.504005644444445 | 0.24 |
| 5.507069430805556 | 0.25 |
| 5.510155996222222 | 0.26 |
| 5.513219782583334 | 0.24 |
| 5.51627995761111 | 0.25 |
| 5.519345132944444 | 0.25 |
| 5.522408085888889 | 0.24 |
| 5.525485761944444 | 0.24 |
| 5.528563437972222 | 0.26 |
| 5.531625835361111 | 0.23 |
| 5.534701844611111 | 0.24 |
| 5.537769242277777 | 0.24 |
| 5.540836362166667 | 0.25 |
| 5.543902093055556 | 0.24 |
| 5.546963934861111 | 0.24 |
| 5.550036332805555 | 0.23 |
| 5.553107619583333 | 0.24 |
| 5.556180295333333 | 0.24 |
| 5.559280472666667 | 0.24 |
| 5.5623648157500005 | 0.25 |
| 5.565452492333334 | 0.25 |
| 5.568533501888889 | 0.23 |
| 5.571610344555555 | 0.25 |
| 5.574671908555556 | 0.26 |
| 5.577737639472222 | 0.25 |
| 5.580806148305555 | 0.25 |
| 5.583896325055555 | 0.25 |
| 5.586960667 | 0.22 |
| 5.590026675694445 | 0.23 |
| 5.593100740388889 | 0.22 |
| 5.596165915722222 | 0.23 |
| 5.599241369416667 | 0.23 |
| 5.602306266916667 | 0.21 |
| 5.6053894988333335 | 0.22 |
| 5.608470230611111 | 0.22 |
| 5.611585964361111 | 0.2 |
| 5.614658640111111 | 0.2 |
| 5.617754650527778 | 0.21 |
| 5.620833993333333 | 0.21 |
| 5.623903057750001 | 0.2 |
| 5.626968510861111 | 0.19 |
| 5.630031186027778 | 0.2 |
| 5.633109973250001 | 0.18 |
| 5.636173204 | 0.2 |
| 5.639235879194444 | 0.22 |
| 5.642306054777778 | 0.23 |
| 5.645386786555556 | 0.22 |
| 5.6484591845 | 0.22 |
| 5.6515460277222225 | 0.23 |
| 5.65461092525 | 0.22 |
| 5.657699713027778 | 0.21 |
| 5.660762665999999 | 0.21 |
| 5.6638306192500005 | 0.23 |
| 5.666903850583333 | 0.22 |
| 5.669964303416667 | 0.21 |
| 5.673051980027778 | 0.21 |
| 5.676174380833333 | 0.21 |
| 5.67925539038889 | 0.21 |
| 5.682328066138889 | 0.21 |
| 5.685389907916666 | 0.23 |
| 5.688466472777778 | 0.23 |
| 5.691529981333333 | 0.21 |
| 5.694590711972222 | 0.21 |
| 5.697656998444444 | 0.2 |
| 5.700741619333333 | 0.21 |
| 5.703814017277778 | 0.21 |
| 5.7068947490555555 | 0.22 |
| 5.709977703166667 | 0.21 |
| 5.713048434361111 | 0.21 |
| 5.71611416525 | 0.23 |
| 5.719174895888889 | 0.21 |
| 5.722248960583333 | 0.22 |
| 5.7253341370555555 | 0.23 |
| 5.728398756777778 | 0.22 |
| 5.731473377083333 | 0.23 |
| 5.734538552416667 | 0.21 |
| 5.737607061249999 | 0.21 |
| 5.740670847583333 | 0.2 |
| 5.743734356138889 | 0.2 |
| 5.746800642638889 | 0.21 |
| 5.749890541611111 | 0.19 |
| 5.752950161055556 | 0.19 |
| 5.756010058277777 | 0.2 |
| 5.759094123555555 | 0.19 |
| 5.762176799888889 | 0.19 |
| 5.765266698833334 | 0.19 |
| 5.768332985333333 | 0.18 |
| 5.771401216388889 | 0.2 |
| 5.774482503722222 | 0.2 |
| 5.777571291499999 | 0.22 |
| 5.780633133305556 | 0.21 |
| 5.783716365222222 | 0.18 |
| 5.786779595972223 | 0.16 |
| 5.789843104527778 | 0.17 |
| 5.792919669388889 | 0.18 |
| 5.795993456305555 | 0.18 |
| 5.799077521611111 | 0.17 |
| 5.802161031305556 | 0.19 |
| 5.805235373805556 | 0.2 |
| 5.808314994388889 | 0.18 |
| 5.811394614972222 | 0.19 |
| 5.814470068666666 | 0.19 |
| 5.817532466055555 | 0.18 |
| 5.820610419888888 | 0.18 |
| 5.823706708083334 | 0.17 |
| 5.826771327805555 | 0.17 |
| 5.82984039225 | 0.17 |
| 5.832910290055556 | 0.16 |
| 5.836020467944444 | 0.19 |
| 5.839087587833333 | 0.16 |
| 5.842153040944444 | 0.18 |
| 5.845219327416667 | 0.2 |
| 5.848292003166667 | 0.19 |
| 5.851353567166666 | 0.19 |
| 5.854432909972222 | 0.19 |
| 5.857515864083333 | 0.21 |
| 5.860580483805556 | 0.18 |
| 5.863678716583333 | 0.19 |
| 5.866744169694445 | 0.18 |
| 5.869817678805555 | 0.18 |
| 5.872906466583333 | 0.17 |
| 5.875971086333333 | 0.19 |
| 5.879047928972223 | 0.17 |
| 5.882131716472222 | 0.18 |
| 5.88519828075 | 0.16 |
| 5.888271234305555 | 0.17 |
| 5.891337243 | 0.15 |
| 5.894406585222222 | 0.16 |
| 5.897506762527778 | 0.17 |
| 5.90056804875 | 0.19 |
| 5.903627946 | 0.19 |
| 5.906701455111111 | 0.16 |
| 5.909788853916667 | 0.16 |
| 5.912855696 | 0.16 |
| 5.915955873333333 | 0.17 |
| 5.919027160111111 | 0.17 |
| 5.9221309487500005 | 0.18 |
| 5.925191679361111 | 0.17 |
| 5.928271299944445 | 0.18 |
| 5.931333419527778 | 0.16 |
| 5.934400817194444 | 0.17 |
| 5.9374721039722225 | 0.16 |
| 5.940539501638889 | 0.17 |
| 5.943603288 | 0.15 |
| 5.946665129805555 | 0.15 |
| 5.949737805555556 | 0.16 |
| 5.952797702777778 | 0.18 |
| 5.955870100722223 | 0.16 |
| 5.958939165166666 | 0.15 |
| 5.962027119555556 | 0.14 |
| 5.9651189630833334 | 0.14 |
| 5.968180249277778 | 0.17 |
| 5.971261814416667 | 0.17 |
| 5.974332823416667 | 0.15 |
| 5.977400776666666 | 0.15 |
| 5.980469841083334 | 0.18 |
| 5.983559184472222 | 0.18 |
| 5.986634638138889 | 0.17 |
| 5.989702869194445 | 0.15 |
| 5.992777211694444 | 0.14 |
| 5.9958565544999995 | 0.15 |
| 5.998927007888889 | 0.15 |
| 6.0019877385 | 0.16 |
| 6.005080415388889 | 0.18 |
| 6.008145312916667 | 0.17 |
| 6.01121048825 | 0.16 |
| 6.014277885916667 | 0.16 |
| 6.01733833875 | 0.16 |
| 6.020407680972222 | 0.16 |
| 6.023470078333333 | 0.19 |
| 6.0265563659722226 | 0.18 |
| 6.029620985722222 | 0.18 |
| 6.032691161305555 | 0.18 |
| 6.035760503527778 | 0.18 |
| 6.038823734305556 | 0.17 |
| 6.041909188555556 | 0.15 |
| 6.044977141805556 | 0.13 |
| 6.0480456506388895 | 0.15 |
| 6.051109159194445 | 0.16 |
| 6.054171001 | 0.15 |
| 6.0572361763055556 | 0.14 |
| 6.060325797472223 | 0.16 |
| 6.063385139138889 | 0.16 |
| 6.066454481361111 | 0.15 |
| 6.069546602666667 | 0.18 |
| 6.0726137225277785 | 0.16 |
| 6.075676953305556 | 0.16 |
| 6.078741295222223 | 0.15 |
| 6.081811748638889 | 0.15 |
| 6.0848777573333335 | 0.14 |
| 6.087937932361111 | 0.15 |
| 6.091018386333333 | 0.15 |
| 6.094083283861112 | 0.13 |
| 6.097165126777777 | 0.14 |
| 6.100260303833333 | 0.13 |
| 6.103344646916667 | 0.14 |
| 6.106437601583334 | 0.12 |
| 6.109526944944445 | 0.11 |
| 6.112591009111111 | 0.14 |
| 6.11568063025 | 0.15 |
| 6.1187674734722215 | 0.13 |
| 6.121840704833333 | 0.14 |
| 6.124921714388889 | 0.13 |
| 6.127985778527778 | 0.12 |
| 6.131055676333333 | 0.11 |
| 6.134121685027778 | 0.12 |
| 6.137187971527778 | 0.11 |
| 6.140250646694445 | 0.11 |
| 6.143325822583334 | 0.09 |
| 6.146398498333333 | 0.09 |
| 6.149459228944445 | 0.11 |
| 6.152526904416667 | 0.11 |
| 6.155608469555555 | 0.11 |
| 6.158683089861111 | 0.11 |
| 6.161754932222222 | 0.09 |
| 6.164822607694444 | 0.1 |
| 6.167895561222223 | 0.13 |
| 6.170988793694445 | 0.12 |
| 6.174055080194444 | 0.13 |
| 6.177134423 | 0.11 |
| 6.1802354336944445 | 0.11 |
| 6.183315887666667 | 0.13 |
| 6.186398008388889 | 0.1 |
| 6.189470128555556 | 0.13 |
| 6.192580862027778 | 0.14 |
| 6.195650482055556 | 0.11 |
| 6.198710934888889 | 0.12 |
| 6.201842502888889 | 0.12 |
| 6.204917678777778 | 0.11 |
| 6.208002855222222 | 0.13 |
| 6.211088587277778 | 0.15 |
| 6.214170152416667 | 0.14 |
| 6.2172450505277785 | 0.15 |
| 6.220328282444444 | 0.13 |
| 6.223410125361111 | 0.13 |
| 6.226502524472223 | 0.14 |
| 6.2295704777222225 | 0.13 |
| 6.232635653027778 | 0.12 |
| 6.235713051277777 | 0.14 |
| 6.238800450083334 | 0.13 |
| 6.241889237861112 | 0.13 |
| 6.244968858472221 | 0.13 |
| 6.2480423675833325 | 0.12 |
| 6.251125043916667 | 0.13 |
| 6.254192441583333 | 0.12 |
| 6.257275395694444 | 0.11 |
| 6.260340293222222 | 0.12 |
| 6.26343074775 | 0.11 |
| 6.266508423777777 | 0.1 |
| 6.2696230463888885 | 0.12 |
| 6.272699055638888 | 0.12 |
| 6.275770897999999 | 0.13 |
| 6.278854963305555 | 0.13 |
| 6.281916805083334 | 0.14 |
| 6.284984480555556 | 0.12 |
| 6.288057156305555 | 0.12 |
| 6.291137610277778 | 0.13 |
| 6.2942394543611115 | 0.13 |
| 6.2973160192222215 | 0.11 |
| 6.300402029055555 | 0.13 |
| 6.303464982027778 | 0.11 |
| 6.306527657194445 | 0.09 |
| 6.309598943972222 | 0.1 |
| 6.312686342777778 | 0.07 |
| 6.3157748527777775 | 0.09 |
| 6.318834750000001 | 0.11 |
| 6.321899925333334 | 0.1 |
| 6.324962322722222 | 0.09 |
| 6.328066666944445 | 0.1 |
| 6.331178233805555 | 0.09 |
| 6.3342967455000005 | 0.1 |
| 6.337394422666666 | 0.09 |
| 6.340454597722222 | 0.08 |
| 6.343519495222222 | 0.06 |
| 6.346633562222222 | 0.07 |
| 6.349714016194444 | 0.09 |
| 6.352782525055555 | 0.09 |
| 6.355867423722223 | 0.09 |
| 6.358947599888889 | 0.1 |
| 6.362019720055556 | 0.1 |
| 6.365093229166667 | 0.11 |
| 6.368164515972222 | 0.09 |
| 6.371252470361111 | 0.09 |
| 6.374318756861111 | 0.11 |
| 6.377391154805556 | 0.11 |
| 6.380452441 | 0.09 |
| 6.38351233825 | 0.11 |
| 6.3865797359166665 | 0.12 |
| 6.389653522833333 | 0.11 |
| 6.392737865916667 | 0.09 |
| 6.395805263583334 | 0.11 |
| 6.3988757169722215 | 0.11 |
| 6.401943114638889 | 0.1 |
| 6.405024957583334 | 0.12 |
| 6.40810180025 | 0.13 |
| 6.411172809222222 | 0.13 |
| 6.414262985972222 | 0.13 |
| 6.417335106138889 | 0.11 |
| 6.420402225999999 | 0.11 |
| 6.4234979586388885 | 0.1 |
| 6.4265825795 | 0.09 |
| 6.42965608863889 | 0.09 |
| 6.432743487444445 | 0.09 |
| 6.435835886527778 | 0.11 |
| 6.438918285055555 | 0.09 |
| 6.441986793916667 | 0.11 |
| 6.4450528026111105 | 0.12 |
| 6.448122978222222 | 0.09 |
| 6.451191209249999 | 0.08 |
| 6.45426221825 | 0.08 |
| 6.457336005166666 | 0.11 |
| 6.4604061807777775 | 0.09 |
| 6.463496357527777 | 0.11 |
| 6.4665904233888885 | 0.08 |
| 6.469669488388889 | 0.07 |
| 6.472730774583333 | 0.09 |
| 6.4758151176666665 | 0.09 |
| 6.478887237833334 | 0.07 |
| 6.4819563022499995 | 0.08 |
| 6.485022033166667 | 0.09 |
| 6.488088319638889 | 0.1 |
| 6.491183496694445 | 0.09 |
| 6.494285896361111 | 0.08 |
| 6.497368850472222 | 0.09 |
| 6.500445693111112 | 0.12 |
| 6.503525035916667 | 0.09 |
| 6.506610212388889 | 0.08 |
| 6.509685943861111 | 0.09 |
| 6.512769453555555 | 0.07 |
| 6.515831573138889 | 0.05 |
| 6.518898693027778 | 0.05 |
| 6.521974146694444 | 0.07 |
| 6.525053767277777 | 0.08 |
| 6.528120053777778 | 0.06 |
| 6.531209952722222 | 0.06 |
| 6.534300685083333 | 0.08 |
| 6.5373622490833325 | 0.08 |
| 6.540461037416667 | 0.08 |
| 6.5435453804999995 | 0.07 |
| 6.5466305569722225 | 0.06 |
| 6.549733512222223 | 0.06 |
| 6.552800909888889 | 0.06 |
| 6.555881641638889 | 0.08 |
| 6.558977374277777 | 0.07 |
| 6.562060050583334 | 0.07 |
| 6.565148560583333 | 0.06 |
| 6.56823345925 | 0.07 |
| 6.571337803472223 | 0.09 |
| 6.574403812166667 | 0.08 |
| 6.577468709694445 | 0.07 |
| 6.580548330277777 | 0.08 |
| 6.5836373958611105 | 0.05 |
| 6.586705904694444 | 0.05 |
| 6.58978997 | 0.07 |
| 6.592868201611111 | 0.06 |
| 6.595939210583333 | 0.06 |
| 6.599001885777778 | 0.07 |
| 6.602075117111111 | 0.05 |
| 6.605156960027778 | 0.06 |
| 6.608226302249999 | 0.04 |
| 6.611314812250001 | 0.05 |
| 6.614395266222222 | 0.05 |
| 6.61746821975 | 0.05 |
| 6.620530617138889 | 0.08 |
| 6.623611904500001 | 0.05 |
| 6.626681246722222 | 0.05 |
| 6.629772256833333 | 0.07 |
| 6.632839098916667 | 0.05 |
| 6.635908163361112 | 0.07 |
| 6.638969171777777 | 0.07 |
| 6.642061848666667 | 0.06 |
| 6.645131190888889 | 0.07 |
| 6.648206644555556 | 0.09 |
| 6.651307655277777 | 0.08 |
| 6.654388664833333 | 0.07 |
| 6.6574491176388895 | 0.08 |
| 6.660528738222222 | 0.09 |
| 6.663599747222222 | 0.08 |
| 6.666702980277778 | 0.07 |
| 6.669764266472223 | 0.07 |
| 6.672826663861111 | 0.08 |
| 6.675946286722223 | 0.07 |
| 6.67901201763889 | 0.06 |
| 6.682110806 | 0.06 |
| 6.685182648361111 | 0.08 |
| 6.688258379833334 | 0.06 |
| 6.691337167055555 | 0.08 |
| 6.694401231194445 | 0.06 |
| 6.6974780738333335 | 0.06 |
| 6.700540471222221 | 0.08 |
| 6.703611758 | 0.09 |
| 6.70669721225 | 0.09 |
| 6.709757665083333 | 0.11 |
| 6.71283311875 | 0.08 |
| 6.715935240638888 | 0.11 |
| 6.719016250194444 | 0.09 |
| 6.722080869916667 | 0.09 |
| 6.725142989527778 | 0.08 |
| 6.728209831583333 | 0.09 |
| 6.731269451027777 | 0.07 |
| 6.734360461166666 | 0.09 |
| 6.737421469583333 | 0.08 |
| 6.740503590305555 | 0.08 |
| 6.743567654444444 | 0.08 |
| 6.746628107277778 | 0.09 |
| 6.749696616111111 | 0.08 |
| 6.752775403333333 | 0.09 |
| 6.755859468611112 | 0.09 |
| 6.758927977472222 | 0.09 |
| 6.7620184320000005 | 0.08 |
| 6.765092218916666 | 0.09 |
| 6.768161838944444 | 0.12 |
| 6.771231736750001 | 0.07 |
| 6.7743055236666665 | 0.07 |
| 6.777369310027778 | 0.06 |
| 6.780430874027778 | 0.08 |
| 6.783512161361112 | 0.08 |
| 6.786574003166667 | 0.08 |
| 6.789659735222223 | 0.06 |
| 6.792727966277778 | 0.09 |
| 6.795798975249999 | 0.09 |
| 6.798894152277778 | 0.09 |
| 6.801988773722222 | 0.09 |
| 6.805050615527778 | 0.07 |
| 6.808114401861111 | 0.07 |
| 6.811215690361111 | 0.08 |
| 6.814296977722222 | 0.08 |
| 6.8173702090555555 | 0.1 |
| 6.820452885361111 | 0.07 |
| 6.8235172273055555 | 0.06 |
| 6.826583513805556 | 0.06 |
| 6.829684802305556 | 0.07 |
| 6.832746366305555 | 0.1 |
| 6.835808763666666 | 0.07 |
| 6.838886995305556 | 0.07 |
| 6.841948559305556 | 0.07 |
| 6.845011234472222 | 0.08 |
| 6.848092799611111 | 0.08 |
| 6.851166030944444 | 0.07 |
| 6.85424537375 | 0.07 |
| 6.857309160111111 | 0.07 |
| 6.8603723908611105 | 0.07 |
| 6.863438677361112 | 0.07 |
| 6.8665027415 | 0.07 |
| 6.869575139444445 | 0.05 |
| 6.872646704027778 | 0.05 |
| 6.875724380055556 | 0.05 |
| 6.87880316725 | 0.06 |
| 6.881875009638889 | 0.07 |
| 6.884954908 | 0.06 |
| 6.888028972722222 | 0.05 |
| 6.891101370666666 | 0.05 |
| 6.894160990111112 | 0.02 |
| 6.897227554416666 | 0.05 |
| 6.900289674 | 0.05 |
| 6.903364294305556 | 0.04 |
| 6.906435858861111 | 0.03 |
| 6.909499089638889 | 0.05 |
| 6.912575098916667 | 0.04 |
| 6.915646663472223 | 0.04 |
| 6.918720172611111 | 0.05 |
| 6.921798959805556 | 0.04 |
| 6.924873580111111 | 0.04 |
| 6.927952367333333 | 0.03 |
| 6.931024209694444 | 0.04 |
| 6.934094385305555 | 0.01 |
| 6.9371915068888885 | 0.05 |
| 6.940261960277778 | 0.03 |
| 6.943332969277778 | 0.04 |
| 6.946416478972223 | 0.05 |
| 6.94948304325 | 0.05 |
| 6.952552385472222 | 0.04 |
| 6.955616171833333 | 0.01 |
| 6.95868051375 | 0.03 |
| 6.96178652475 | 0.02 |
| 6.964851977861111 | 0.03 |
| 6.967922986861111 | 0.05 |
| 6.970987606583334 | 0.04 |
| 6.974064171444445 | 0.04 |
| 6.977145458777778 | 0.03 |
| 6.98020841175 | 0.03 |
| 6.983289976888889 | 0.03 |
| 6.986360430305555 | 0.01 |
| 6.989438661916666 | 0.02 |
| 6.992502448277778 | 0.04 |
| 6.995575679611111 | 0.04 |
| 6.998655300194444 | 0.03 |
| 7.001721031083333 | 0.02 |
| 7.004793984638889 | 0.02 |
| 7.007865271416667 | 0.03 |
| 7.010926835416667 | 0.04 |
| 7.014021179055555 | 0.02 |
| 7.017095521583334 | 0.04 |
| 7.020178475694444 | 0.06 |
| 7.023240317472222 | 0.05 |
| 7.026305215 | 0.04 |
| 7.029380946472222 | 0.04 |
| 7.032442510499999 | 0.05 |
| 7.03552074211111 | 0.02 |
| 7.038596751388889 | 0.05 |
| 7.041677760944445 | 0.05 |
| 7.044740436111111 | 0.04 |
| 7.047820612277778 | 0.04 |
| 7.050896065972222 | 0.03 |
| 7.053957074388888 | 0.03 |
| 7.057020582944444 | 0.03 |
| 7.060082424722222 | 0.03 |
| 7.063152878138888 | 0.03 |
| 7.066232220916667 | 0.05 |
| 7.069302118722223 | 0.02 |
| 7.072366460666666 | 0.03 |
| 7.075439969805556 | 0.02 |
| 7.078507367472222 | 0.02 |
| 7.081578932027778 | 0.02 |
| 7.0846674420277775 | 0.04 |
| 7.087740395555556 | 0.03 |
| 7.090804181916667 | 0.04 |
| 7.093886580444444 | 0.04 |
| 7.0969545336944435 | 0.04 |
| 7.1000149865277775 | 0.03 |
| 7.103093218138889 | 0.03 |
| 7.106153670972222 | 0.03 |
| 7.109230513611111 | 0.05 |
| 7.112301800388889 | 0.02 |
| 7.115372253805556 | 0.03 |
| 7.118449374250001 | 0.03 |
| 7.121515660722222 | 0.04 |
| 7.124576946944444 | 0.05 |
| 7.127662678999999 | 0.04 |
| 7.130723687416666 | 0.03 |
| 7.133801363444444 | 0.04 |
| 7.136872650222223 | 0.02 |
| 7.139943937 | 0.03 |
| 7.143018835083334 | 0.02 |
| 7.146093177611111 | 0.04 |
| 7.14915724175 | 0.04 |
| 7.152233251 | 0.04 |
| 7.155299259722223 | 0.04 |
| 7.158365546194444 | 0.03 |
| 7.1614465557499996 | 0.01 |
| 7.1645100643055555 | 0 |
| 7.167605519138888 | 0.02 |
| 7.170668472111111 | 0.02 |
| 7.173732814055556 | 0.01 |
| 7.176809101111111 | 0.02 |
| 7.179889555083334 | 0.01 |
| 7.182952508055555 | 0.02 |
| 7.186030461888889 | 0.01 |
| 7.189102026444444 | 0.01 |
| 7.192165535 | 0 |
| 7.195246544555555 | 0 |
| 7.198327276333334 | 0 |
| 7.201392451638889 | 0.01 |
| 7.2044734611944445 | 0.01 |
| 7.207535025194445 | 0 |
| 7.2105999227222215 | 0 |
| 7.213660931138889 | -0.02 |
| 7.216737218194444 | -0.01 |
| 7.2198037825 | 0.01 |
| 7.222872291333333 | 0.02 |
| 7.2259699685 | 0.02 |
| 7.229049033527778 | 0 |
| 7.232129487472221 | 0 |
| 7.2352257756944445 | 0 |
| 7.238295395722222 | 0.01 |
| 7.241356681916667 | 0 |
| 7.244422968416667 | 0 |
| 7.247493144 | 0 |
| 7.250556930361111 | 0.02 |
| 7.253624050222222 | 0 |
| 7.256695337027778 | 0 |
| 7.2597596789444445 | -0.01 |
| 7.262839299527778 | 0 |
| 7.265915308805556 | -0.01 |
| 7.268997707333334 | 0 |
| 7.272066493972223 | 0 |
| 7.275128613555556 | 0 |
| 7.27819934475 | 0 |
| 7.281296466333333 | -0.01 |
| 7.284370531055556 | 0 |
| 7.287431539472222 | 0 |
| 7.290498659333333 | 0.01 |
| 7.293572168472222 | 0.02 |
| 7.296632621305556 | 0 |
| 7.299711130722222 | 0.02 |
| 7.302779083972222 | 0 |
| 7.305864816027778 | 0 |
| 7.308956937305555 | -0.01 |
| 7.312017945722222 | 0 |
| 7.315104788944445 | 0 |
| 7.318182742777778 | -0.02 |
| 7.3212459735555555 | 0 |
| 7.324323371777778 | -0.03 |
| 7.32738882488889 | -0.02 |
| 7.330463722999999 | -0.02 |
| 7.333543621361111 | -0.01 |
| 7.336605463166666 | -0.01 |
| 7.339681194638889 | -0.01 |
| 7.342764982138888 | -0.03 |
| 7.3458371023055555 | -0.01 |
| 7.348907833499999 | 0 |
| 7.351970230861111 | -0.01 |
| 7.35503262825 | -0.01 |
| 7.35811641575 | -0.01 |
| 7.3611882581111105 | 0 |
| 7.3642681565 | 0 |
| 7.3673541663333335 | 0.01 |
| 7.370416285916667 | 0 |
| 7.373488961666666 | 0 |
| 7.376561359638889 | 0 |
| 7.379622368027778 | 0 |
| 7.382700044083334 | 0 |
| 7.385772164222222 | -0.01 |
| 7.388840117472222 | 0 |
| 7.391925016166667 | 0 |
| 7.39499435838889 | 0 |
| 7.398055922388889 | 0 |
| 7.401129987083334 | -0.01 |
| 7.404217663694444 | -0.03 |
| 7.407300617805555 | -0.02 |
| 7.410383016333333 | -0.01 |
| 7.413454858694444 | -0.01 |
| 7.416524478722222 | -0.01 |
| 7.419604377111111 | -0.03 |
| 7.422685108861111 | -0.01 |
| 7.425749173 | -0.03 |
| 7.428864906777777 | -0.03 |
| 7.43192785975 | -0.02 |
| 7.435016925305556 | -0.01 |
| 7.438088489888889 | 0 |
| 7.441156165361111 | 0.01 |
| 7.4442216184722225 | 0 |
| 7.447295405388889 | 0 |
| 7.450358358361111 | 0 |
| 7.453427978361112 | 0 |
| 7.456501765277777 | 0 |
| 7.459566940611111 | 0 |
| 7.462634893861112 | -0.01 |
| 7.465712847694444 | 0 |
| 7.4687921904722225 | 0.01 |
| 7.471854032277778 | 0.01 |
| 7.474926985805555 | 0 |
| 7.477996050250001 | 0.01 |
| 7.4810667814444445 | 0 |
| 7.484139457194444 | 0 |
| 7.487216022055556 | 0 |
| 7.490275363694444 | 0 |
| 7.4933402612222215 | -0.01 |
| 7.496415992694445 | -0.01 |
| 7.4994889462500005 | -0.01 |
| 7.502557732861112 | 0 |
| 7.505628186277777 | 0 |
| 7.508691417027778 | 0 |
| 7.511787983027777 | 0 |
| 7.514848435861111 | 0.01 |
| 7.517915555722222 | 0.01 |
| 7.521000454388889 | -0.01 |
| 7.524065351916667 | -0.02 |
| 7.527129971666667 | -0.02 |
| 7.530199591666666 | -0.04 |
| 7.5332636558055555 | -0.04 |
| 7.5363477211111105 | -0.03 |
| 7.539417341111111 | -0.03 |
| 7.5424894612777775 | -0.02 |
| 7.545586305083333 | -0.01 |
| 7.548648702472222 | -0.02 |
| 7.551708877499999 | -0.03 |
| 7.5547834978055555 | -0.03 |
| 7.55785117325 | -0.01 |
| 7.560926626944444 | -0.03 |
| 7.563989857694445 | -0.02 |
| 7.567056144194444 | -0.01 |
| 7.570131320083333 | 0 |
| 7.573191772916667 | -0.03 |
| 7.576279727305556 | -0.04 |
| 7.579363792583333 | -0.01 |
| 7.582432579222223 | -0.02 |
| 7.585497754555556 | -0.03 |
| 7.5885662633888895 | -0.03 |
| 7.591658940277777 | -0.04 |
| 7.594786619166666 | -0.04 |
| 7.597853183472222 | -0.04 |
| 7.600923359055556 | -0.03 |
| 7.603986589833333 | -0.03 |
| 7.607101212416667 | -0.04 |
| 7.6101855555 | -0.05 |
| 7.613254897722221 | -0.05 |
| 7.616325351111111 | -0.04 |
| 7.619386915111112 | -0.05 |
| 7.62245097925 | -0.04 |
| 7.625525599555556 | -0.03 |
| 7.628624110111112 | -0.04 |
| 7.631696230277778 | -0.05 |
| 7.634772795138889 | -0.04 |
| 7.63784852661111 | -0.05 |
| 7.640930647361111 | -0.05 |
| 7.643996100472223 | -0.04 |
| 7.647090999694444 | -0.04 |
| 7.6501642310277775 | -0.02 |
| 7.653255518972222 | -0.02 |
| 7.656326527944445 | -0.02 |
| 7.659391425472222 | -0.02 |
| 7.662472712805555 | -0.04 |
| 7.665557333694445 | -0.05 |
| 7.668648066027778 | -0.05 |
| 7.671709352222222 | -0.03 |
| 7.674786750472222 | -0.02 |
| 7.6778477588888885 | -0.03 |
| 7.680910156277778 | -0.01 |
| 7.683973387027778 | -0.03 |
| 7.6870393957222225 | -0.01 |
| 7.690111238083333 | -0.04 |
| 7.693191414277777 | -0.04 |
| 7.6962540894444444 | -0.04 |
| 7.699316764611112 | -0.03 |
| 7.7023919405 | -0.02 |
| 7.705458227 | -0.02 |
| 7.70854368125 | -0.03 |
| 7.711624413027778 | -0.03 |
| 7.714691255111111 | -0.04 |
| 7.717762541888888 | -0.03 |
| 7.720825217055555 | -0.01 |
| 7.723911226888888 | -0.03 |
| 7.726990569694444 | -0.04 |
| 7.730074634972222 | -0.03 |
| 7.733145088388889 | -0.02 |
| 7.7362327650000005 | -0.04 |
| 7.739312107777778 | -0.02 |
| 7.742387005888889 | -0.04 |
| 7.745457181472222 | -0.04 |
| 7.748522634583334 | -0.06 |
| 7.751594754749999 | -0.05 |
| 7.754680486805555 | -0.04 |
| 7.757742606388889 | -0.05 |
| 7.76081444875 | -0.03 |
| 7.763899903 | -0.04 |
| 7.766961189222222 | -0.03 |
| 7.7700421987777775 | -0.02 |
| 7.773126264055556 | -0.03 |
| 7.776224219027778 | 0 |
| 7.779293839055556 | -0.01 |
| 7.782364848027777 | -0.01 |
| 7.785446968777778 | -0.01 |
| 7.788546034916666 | -0.01 |
| 7.791615099333334 | -0.01 |
| 7.794712220944445 | -0.01 |
| 7.7977782296388884 | -0.01 |
| 7.80083979363889 | -0.01 |
| 7.803917469666667 | 0 |
| 7.806986811888889 | -0.01 |
| 7.810058932055556 | 0 |
| 7.813124107361111 | 0 |
| 7.8161976165 | -0.02 |
| 7.8192766815 | -0.02 |
| 7.822337967694445 | 0 |
| 7.825420644027778 | -0.03 |
| 7.828504987111112 | 0 |
| 7.831575718277778 | -0.02 |
| 7.834646171694445 | -0.03 |
| 7.837727459027778 | -0.03 |
| 7.840795967888889 | -0.04 |
| 7.843858920861111 | -0.04 |
| 7.846927985277778 | -0.02 |
| 7.8499892715 | -0.05 |
| 7.853059447083333 | -0.04 |
| 7.856130456083334 | -0.03 |
| 7.8591995205 | -0.04 |
| 7.862269973888889 | -0.02 |
| 7.865348205527778 | -0.04 |
| 7.868410325111111 | -0.04 |
| 7.871483278638888 | -0.04 |
| 7.874578733472222 | -0.03 |
| 7.877662798777778 | -0.05 |
| 7.880736863472222 | -0.05 |
| 7.883801483222222 | -0.05 |
| 7.886873047777778 | -0.04 |
| 7.8899679470277775 | -0.05 |
| 7.893048956583333 | -0.05 |
| 7.896135244222222 | -0.04 |
| 7.8991968082222215 | -0.05 |
| 7.902286151583334 | -0.03 |
| 7.905349937944444 | -0.05 |
| 7.908416224416667 | -0.06 |
| 7.911490011361111 | -0.06 |
| 7.914566854 | -0.05 |
| 7.917658419722222 | -0.06 |
| 7.920723872833333 | -0.08 |
| 7.923820994416666 | -0.05 |
| 7.926891447805556 | -0.05 |
| 7.929991902944444 | -0.05 |
| 7.933064023083333 | -0.06 |
| 7.936155588805556 | -0.05 |
| 7.93923743175 | -0.08 |
| 7.942770133805555 | -0.06 |
| 7.945841420583334 | -0.06 |
| 7.948906318111112 | -0.06 |
| 7.951972604611111 | -0.05 |
| 7.955081393527778 | -0.06 |
| 7.958151013527778 | -0.08 |
| 7.961247301749999 | -0.08 |
| 7.964324977777778 | -0.06 |
| 7.967402653805556 | -0.07 |
| 7.970477829694444 | -0.07 |
| 7.973545505166666 | -0.08 |
| 7.976609013722222 | -0.07 |
| 7.979668910972222 | -0.07 |
| 7.982752698444445 | -0.03 |
| 7.985852042388888 | -0.06 |
| 7.988951941916667 | -0.04 |
| 7.992018506194444 | -0.07 |
| 7.995103960472223 | -0.08 |
| 7.998177747388889 | -0.06 |
| 8.00124014475 | -0.07 |
| 8.004428660472222 | -0.08 |
| 8.00750244738889 | -0.07 |
| 8.010594568694444 | -0.06 |
| 8.013662244166666 | -0.06 |
| 8.016736031083333 | -0.06 |
| 8.019799539638889 | -0.09 |
| 8.022877493472222 | -0.08 |
| 8.025987393555555 | -0.08 |
| 8.029075903555555 | -0.1 |
| 8.032153301777779 | -0.1 |
| 8.035235422527778 | -0.12 |
| 8.038322265749999 | -0.11 |
| 8.041392719138889 | -0.09 |
| 8.044470117388888 | -0.09 |
| 8.04755223811111 | -0.11 |
| 8.050627414000001 | -0.1 |
| 8.053713979416667 | -0.11 |
| 8.056802211611112 | -0.13 |
| 8.059877665305555 | -0.12 |
| 8.062970897777777 | -0.12 |
| 8.066040517805556 | -0.11 |
| 8.069108193249999 | -0.12 |
| 8.072200592361112 | -0.12 |
| 8.075272156916666 | -0.12 |
| 8.07833510988889 | -0.13 |
| 8.081418064 | -0.11 |
| 8.084494351083332 | -0.09 |
| 8.087564248888889 | -0.12 |
| 8.090641924916667 | -0.14 |
| 8.093752658388889 | -0.11 |
| 8.096852002333334 | -0.12 |
| 8.099936901 | -0.11 |
| 8.10299679825 | -0.11 |
| 8.106065029305555 | -0.11 |
| 8.109134093722222 | -0.1 |
| 8.112233437666667 | -0.1 |
| 8.115295001666667 | -0.1 |
| 8.118363232722222 | -0.09 |
| 8.12143840861111 | -0.09 |
| 8.124505806277778 | -0.1 |
| 8.127631818388888 | -0.08 |
| 8.130715605888888 | -0.1 |
| 8.133779947833334 | -0.08 |
| 8.13684901225 | -0.08 |
| 8.139927243888888 | -0.07 |
| 8.1429879745 | -0.08 |
| 8.146061483638888 | -0.09 |
| 8.149149993611111 | -0.08 |
| 8.152224058333333 | -0.09 |
| 8.155290900416666 | -0.1 |
| 8.158374965694444 | -0.09 |
| 8.161449030416666 | -0.05 |
| 8.164528095416667 | -0.05 |
| 8.167611327305556 | -0.06 |
| 8.17068511425 | -0.05 |
| 8.173755845444445 | -0.05 |
| 8.176821854138888 | -0.08 |
| 8.17988980738889 | -0.08 |
| 8.182977206194446 | -0.06 |
| 8.186055160027779 | -0.07 |
| 8.189118946361111 | -0.06 |
| 8.192185232861112 | -0.04 |
| 8.195264020083332 | -0.06 |
| 8.198326417444445 | -0.05 |
| 8.201393537333333 | -0.04 |
| 8.204472324527778 | -0.05 |
| 8.207545000277777 | -0.05 |
| 8.210613786916667 | -0.08 |
| 8.213688407222223 | -0.06 |
| 8.216753026944444 | -0.07 |
| 8.21981875786111 | -0.08 |
| 8.22288671111111 | -0.08 |
| 8.225997166805556 | -0.09 |
| 8.229267909416667 | -0.1 |
| 8.232328084472222 | -0.08 |
| 8.235392981972222 | -0.07 |
| 8.238458157305555 | -0.1 |
| 8.241518332333333 | -0.09 |
| 8.24459211925 | -0.09 |
| 8.247673962194446 | -0.09 |
| 8.250734970611111 | -0.09 |
| 8.2538101465 | -0.09 |
| 8.25687726636111 | -0.09 |
| 8.259951886666666 | -0.09 |
| 8.263013728472222 | -0.11 |
| 8.266095849194445 | -0.1 |
| 8.269160191138889 | -0.11 |
| 8.272225088666666 | -0.11 |
| 8.27529109736111 | -0.11 |
| 8.278400719666667 | -0.09 |
| 8.28147784011111 | -0.14 |
| 8.284564405527778 | -0.14 |
| 8.287639303638889 | -0.13 |
| 8.29070864586111 | -0.13 |
| 8.293772987805555 | -0.13 |
| 8.296842885611111 | -0.14 |
| 8.299962508472223 | -0.12 |
| 8.303032406305556 | -0.12 |
| 8.306112582472222 | -0.12 |
| 8.309176368805556 | -0.12 |
| 8.312241266333334 | -0.13 |
| 8.315325053833334 | -0.12 |
| 8.318408007944445 | -0.13 |
| 8.321513741138888 | -0.13 |
| 8.324579472055555 | -0.13 |
| 8.327667148666666 | -0.13 |
| 8.330750102777777 | -0.14 |
| 8.333811666777779 | -0.11 |
| 8.336910732916666 | -0.12 |
| 8.34001424375 | -0.09 |
| 8.343119699166667 | -0.11 |
| 8.346207097972222 | -0.12 |
| 8.349270606527778 | -0.1 |
| 8.352356338583334 | -0.12 |
| 8.355420402722222 | -0.12 |
| 8.358508079333333 | -0.11 |
| 8.361575199194444 | -0.11 |
| 8.364657042138889 | -0.13 |
| 8.367742774194445 | -0.14 |
| 8.370806560527777 | -0.13 |
| 8.37387340261111 | -0.14 |
| 8.37694218925 | -0.11 |
| 8.3800101425 | -0.12 |
| 8.383083373833333 | -0.13 |
| 8.386147160194444 | -0.13 |
| 8.389235670166666 | -0.14 |
| 8.392299178722222 | -0.12 |
| 8.39541185675 | -0.13 |
| 8.398480921194444 | -0.13 |
| 8.40155165238889 | -0.11 |
| 8.404614883138889 | -0.12 |
| 8.407682280805556 | -0.12 |
| 8.410761345805556 | -0.12 |
| 8.413841244194444 | -0.13 |
| 8.416902252611111 | -0.12 |
| 8.420006596833334 | -0.14 |
| 8.42308510625 | -0.14 |
| 8.426155559638888 | -0.14 |
| 8.429246847555556 | -0.12 |
| 8.4323111895 | -0.12 |
| 8.435398032722222 | -0.12 |
| 8.438482375805556 | -0.12 |
| 8.441566441111112 | -0.13 |
| 8.444636616694444 | -0.13 |
| 8.447696513944445 | -0.12 |
| 8.450766689555556 | -0.14 |
| 8.453844365583333 | -0.16 |
| 8.456908429722223 | -0.14 |
| 8.459971660472222 | -0.13 |
| 8.46305961488889 | -0.14 |
| 8.466122567861111 | -0.15 |
| 8.469201355055556 | -0.14 |
| 8.472270697277777 | -0.13 |
| 8.475346706555555 | -0.15 |
| 8.478418271111112 | -0.12 |
| 8.481486224388888 | -0.11 |
| 8.484590568611111 | -0.11 |
| 8.487659910833333 | -0.14 |
| 8.490720363666668 | -0.11 |
| 8.493801095416666 | -0.14 |
| 8.496877938055556 | -0.14 |
| 8.499939779861112 | -0.12 |
| 8.503009122083332 | -0.11 |
| 8.506080131083333 | -0.12 |
| 8.509154473583333 | -0.11 |
| 8.512231594027778 | -0.12 |
| 8.515296491555556 | -0.13 |
| 8.518376667722222 | -0.11 |
| 8.521466288888888 | -0.12 |
| 8.524528130666667 | -0.13 |
| 8.527594694972223 | -0.12 |
| 8.530657925722222 | -0.12 |
| 8.533721712083333 | -0.13 |
| 8.536781331527777 | -0.11 |
| 8.539860396527777 | -0.15 |
| 8.54293362786111 | -0.14 |
| 8.546001581111112 | -0.16 |
| 8.549085090805555 | -0.15 |
| 8.552150821722222 | -0.11 |
| 8.555220719527778 | -0.13 |
| 8.558335897694445 | -0.16 |
| 8.561403017583332 | -0.16 |
| 8.564467637305556 | -0.15 |
| 8.567559203027777 | -0.14 |
| 8.570618544666667 | -0.14 |
| 8.573684275583334 | -0.15 |
| 8.576748617527779 | -0.16 |
| 8.579809903722223 | -0.14 |
| 8.582899247083335 | -0.16 |
| 8.585971922833334 | -0.16 |
| 8.589046820944445 | -0.15 |
| 8.592131441805556 | -0.15 |
| 8.595211618 | -0.14 |
| 8.598291516361112 | -0.16 |
| 8.601372803722223 | -0.14 |
| 8.604432700972222 | -0.13 |
| 8.607495931722221 | -0.14 |
| 8.610591386555555 | -0.16 |
| 8.613667951416666 | -0.15 |
| 8.61673896038889 | -0.15 |
| 8.619799691 | -0.16 |
| 8.622869866611111 | -0.14 |
| 8.62594087561111 | -0.15 |
| 8.629011051194444 | -0.18 |
| 8.63209678325 | -0.16 |
| 8.635163347527778 | -0.17 |
| 8.63824435711111 | -0.17 |
| 8.641327033416667 | -0.16 |
| 8.644393042111112 | -0.13 |
| 8.647455161694445 | -0.17 |
| 8.650525059527778 | -0.16 |
| 8.653586067916667 | -0.16 |
| 8.656676522472221 | -0.15 |
| 8.659748364833334 | -0.16 |
| 8.66281492911111 | -0.17 |
| 8.66589316075 | -0.14 |
| 8.668965558694445 | -0.13 |
| 8.672040179 | -0.14 |
| 8.675138689555556 | -0.14 |
| 8.678217476750001 | -0.14 |
| 8.681304597777778 | -0.14 |
| 8.684378384694444 | -0.15 |
| 8.687447171333334 | -0.15 |
| 8.690517069138888 | -0.14 |
| 8.693598634305555 | -0.12 |
| 8.696679366055555 | -0.13 |
| 8.699753708555555 | -0.14 |
| 8.702818606083333 | -0.13 |
| 8.70589794888889 | -0.14 |
| 8.708960624055555 | -0.16 |
| 8.712029966277777 | -0.16 |
| 8.715101530861112 | -0.17 |
| 8.718161705888889 | -0.15 |
| 8.72124632675 | -0.14 |
| 8.724308168555556 | -0.15 |
| 8.72737806636111 | -0.14 |
| 8.7304421305 | -0.16 |
| 8.733503416722222 | -0.15 |
| 8.736575259083333 | -0.16 |
| 8.739643212333334 | -0.14 |
| 8.742713110138888 | -0.13 |
| 8.74578884161111 | -0.14 |
| 8.748849850027778 | -0.16 |
| 8.75193669325 | -0.16 |
| 8.755012702527777 | -0.15 |
| 8.758090378555556 | -0.14 |
| 8.761181944277778 | -0.13 |
| 8.764246008416666 | -0.14 |
| 8.767307850222222 | -0.15 |
| 8.770386637416665 | -0.15 |
| 8.773452923916667 | -0.13 |
| 8.776522543944445 | -0.14 |
| 8.779591052777779 | -0.13 |
| 8.78265817263889 | -0.14 |
| 8.785746404833333 | -0.14 |
| 8.788819913972223 | -0.14 |
| 8.791894534277777 | -0.14 |
| 8.79496943236111 | -0.15 |
| 8.798048497361112 | -0.13 |
| 8.801116728416668 | -0.14 |
| 8.804208294138888 | -0.16 |
| 8.807270691527778 | -0.14 |
| 8.810349478722221 | -0.16 |
| 8.813448267083333 | -0.15 |
| 8.816565389805556 | -0.15 |
| 8.819654177583333 | -0.15 |
| 8.822717963944443 | -0.16 |
| 8.825783694833333 | -0.17 |
| 8.828860259694444 | -0.14 |
| 8.831922379305556 | -0.14 |
| 8.834995055027777 | -0.12 |
| 8.83805550786111 | -0.13 |
| 8.841139017555555 | -0.12 |
| 8.844199192583334 | -0.12 |
| 8.847259645416667 | -0.13 |
| 8.850323153972221 | -0.15 |
| 8.853386106944445 | -0.15 |
| 8.85644794875 | -0.14 |
| 8.859542847972222 | -0.13 |
| 8.862605800944445 | -0.13 |
| 8.865667642750001 | -0.13 |
| 8.868749763472222 | -0.13 |
| 8.871810771888889 | -0.13 |
| 8.874904004361111 | -0.12 |
| 8.877978902472222 | -0.13 |
| 8.881055467333333 | -0.12 |
| 8.884117309111112 | -0.12 |
| 8.887184429 | -0.13 |
| 8.890245715194444 | -0.14 |
| 8.893308945972223 | -0.14 |
| 8.896376621416666 | -0.13 |
| 8.899442352333333 | -0.15 |
| 8.902530584527778 | -0.17 |
| 8.905591037333334 | -0.16 |
| 8.908687603333334 | -0.17 |
| 8.911752778666667 | -0.16 |
| 8.914814620444444 | -0.17 |
| 8.917893407666668 | -0.16 |
| 8.920958860777779 | -0.14 |
| 8.924020146972222 | -0.15 |
| 8.927083933333334 | -0.16 |
| 8.930163276138888 | -0.13 |
| 8.933246785833333 | -0.13 |
| 8.936322517305555 | -0.15 |
| 8.939408249361112 | -0.17 |
| 8.942487314361111 | -0.15 |
| 8.945567768333333 | -0.12 |
| 8.948635721583333 | -0.14 |
| 8.95170867511111 | -0.15 |
| 8.954794129388889 | -0.14 |
| 8.95785569338889 | -0.14 |
| 8.96091725738889 | -0.14 |
| 8.963981599305555 | -0.16 |
| 8.967045663444445 | -0.16 |
| 8.970110560972222 | -0.16 |
| 8.973177680861111 | -0.15 |
| 8.976251745583333 | -0.14 |
| 8.979330532777778 | -0.14 |
| 8.98239765263889 | -0.16 |
| 8.985483106916668 | -0.16 |
| 8.988545226500001 | -0.17 |
| 8.991610124027778 | -0.14 |
| 8.994683910944445 | -0.15 |
| 8.997744641555554 | -0.15 |
| 9.0008264845 | -0.14 |
| 9.00390388275 | -0.15 |
| 9.006974613916666 | -0.16 |
| 9.010041456 | -0.15 |
| 9.01312441011111 | -0.14 |
| 9.016189585444444 | -0.14 |
| 9.019257538694445 | -0.14 |
| 9.02232354738889 | -0.15 |
| 9.025388444916667 | -0.13 |
| 9.028473343583334 | -0.14 |
| 9.031547686083334 | -0.14 |
| 9.034614528166667 | -0.15 |
| 9.037676092166667 | -0.15 |
| 9.04073737838889 | -0.14 |
| 9.043820332500001 | -0.13 |
| 9.046882174277778 | -0.16 |
| 9.049950127555556 | -0.16 |
| 9.053036137388888 | -0.16 |
| 9.056107701972222 | -0.15 |
| 9.059188711527778 | -0.13 |
| 9.062282777388889 | -0.14 |
| 9.0653482305 | -0.16 |
| 9.068436184888888 | -0.14 |
| 9.071533028694445 | -0.16 |
| 9.074605982222222 | -0.15 |
| 9.077678380166667 | -0.14 |
| 9.080752167111111 | -0.13 |
| 9.083826787388888 | -0.15 |
| 9.086896685222223 | -0.15 |
| 9.089977139166667 | -0.15 |
| 9.093055093 | -0.18 |
| 9.096143047416668 | -0.14 |
| 9.099206555972222 | -0.14 |
| 9.102278676111112 | -0.15 |
| 9.105364408166666 | -0.14 |
| 9.108433472611111 | -0.13 |
| 9.111506148333333 | -0.15 |
| 9.114572712638887 | -0.14 |
| 9.117640388083334 | -0.12 |
| 9.120722786611111 | -0.13 |
| 9.123795184583333 | -0.12 |
| 9.126858415333334 | -0.14 |
| 9.12994164725 | -0.13 |
| 9.133012100638888 | -0.1 |
| 9.136073386833333 | -0.12 |
| 9.139156340972223 | -0.11 |
| 9.142219016138888 | -0.11 |
| 9.145301692444443 | -0.11 |
| 9.148374645999999 | -0.1 |
| 9.15144732175 | -0.13 |
| 9.154525553361111 | -0.12 |
| 9.157595451166667 | -0.12 |
| 9.16068368336111 | -0.13 |
| 9.163765526305557 | -0.13 |
| 9.166835146305555 | -0.13 |
| 9.169895043555554 | -0.13 |
| 9.172961330055557 | -0.13 |
| 9.176040395055557 | -0.11 |
| 9.179105292583333 | -0.14 |
| 9.182177412722222 | -0.14 |
| 9.185240921277778 | -0.11 |
| 9.188323875388889 | -0.12 |
| 9.191389328527778 | -0.15 |
| 9.194485338916667 | -0.13 |
| 9.197569959805556 | -0.13 |
| 9.20063763527778 | -0.16 |
| 9.203712811166668 | -0.15 |
| 9.20678770925 | -0.14 |
| 9.2098556625 | -0.15 |
| 9.212931116194444 | -0.12 |
| 9.216008514416666 | -0.13 |
| 9.219074245333333 | -0.13 |
| 9.222159699583333 | -0.16 |
| 9.225225430499998 | -0.12 |
| 9.22830616225 | -0.13 |
| 9.23137244875 | -0.13 |
| 9.234437068472221 | -0.16 |
| 9.237496965722222 | -0.15 |
| 9.24056186325 | -0.14 |
| 9.243648706472221 | -0.13 |
| 9.246719437666666 | -0.11 |
| 9.249792669000001 | -0.12 |
| 9.252880623388888 | -0.11 |
| 9.255942742972222 | -0.09 |
| 9.2590076405 | -0.12 |
| 9.26208253861111 | -0.11 |
| 9.265146880527777 | -0.11 |
| 9.268239279638887 | -0.11 |
| 9.271301954805555 | -0.09 |
| 9.274387964666667 | -0.1 |
| 9.27747314111111 | -0.11 |
| 9.280540816583333 | -0.14 |
| 9.283622659527778 | -0.14 |
| 9.286698668777777 | -0.14 |
| 9.289775789222222 | -0.14 |
| 9.292857909972222 | -0.15 |
| 9.295925307638889 | -0.13 |
| 9.299012428638889 | -0.14 |
| 9.30207704838889 | -0.14 |
| 9.305157224555554 | -0.14 |
| 9.308259902027778 | -0.12 |
| 9.311354245666665 | -0.13 |
| 9.314416643055557 | -0.13 |
| 9.317503764083334 | -0.12 |
| 9.320592274055555 | -0.11 |
| 9.323665783194445 | -0.15 |
| 9.326726235999999 | -0.13 |
| 9.329801689694444 | -0.15 |
| 9.332898255694444 | -0.15 |
| 9.335963153222222 | -0.12 |
| 9.339028328527778 | -0.13 |
| 9.342096281805556 | -0.13 |
| 9.345168124166667 | -0.13 |
| 9.348256078555554 | -0.13 |
| 9.351316809166665 | -0.13 |
| 9.35437976213889 | -0.12 |
| 9.357478272694445 | -0.11 |
| 9.360543448027778 | -0.14 |
| 9.363632513583333 | -0.15 |
| 9.366707689472223 | -0.14 |
| 9.369770642444445 | -0.13 |
| 9.372854985527779 | -0.12 |
| 9.3759179385 | -0.13 |
| 9.379009504222223 | -0.11 |
| 9.382097736416666 | -0.12 |
| 9.385169023194445 | -0.13 |
| 9.388233642916667 | -0.12 |
| 9.391294373527778 | -0.12 |
| 9.394362604583334 | -0.09 |
| 9.397444169722222 | -0.1 |
| 9.400509622833335 | -0.12 |
| 9.403586743277778 | -0.12 |
| 9.406655529916668 | -0.14 |
| 9.409741817555556 | -0.12 |
| 9.412838105777777 | -0.13 |
| 9.415907725777776 | -0.11 |
| 9.418985679611112 | -0.12 |
| 9.42205196611111 | -0.12 |
| 9.42511686363889 | -0.11 |
| 9.428200928916667 | -0.11 |
| 9.431288049944445 | -0.09 |
| 9.434356836583333 | -0.09 |
| 9.437441179666667 | -0.11 |
| 9.44051691113889 | -0.11 |
| 9.443608199055555 | -0.1 |
| 9.446669207472222 | -0.09 |
| 9.44973327161111 | -0.11 |
| 9.452810392055556 | -0.12 |
| 9.455879178694445 | -0.12 |
| 9.458961855 | -0.11 |
| 9.462031197222222 | -0.1 |
| 9.465113873555556 | -0.09 |
| 9.468202661333333 | -0.11 |
| 9.471280337361112 | -0.1 |
| 9.474352735305555 | -0.08 |
| 9.47741791063889 | -0.08 |
| 9.480490864166667 | -0.09 |
| 9.483560484194445 | -0.11 |
| 9.486684551777778 | -0.09 |
| 9.489758338694443 | -0.1 |
| 9.492854626888889 | -0.08 |
| 9.495919802222222 | -0.08 |
| 9.499031646861111 | -0.07 |
| 9.50209793336111 | -0.09 |
| 9.505171164694445 | -0.08 |
| 9.508262174833334 | -0.1 |
| 9.511359296416668 | -0.11 |
| 9.514446973027779 | -0.1 |
| 9.51751075936111 | -0.09 |
| 9.520577323666668 | -0.1 |
| 9.523659722194445 | -0.12 |
| 9.526732120138888 | -0.11 |
| 9.529796739861112 | -0.1 |
| 9.532874693694444 | -0.11 |
| 9.535960703527778 | -0.12 |
| 9.539042824277777 | -0.14 |
| 9.542142168194445 | -0.14 |
| 9.545225955694445 | -0.13 |
| 9.548289742055555 | -0.12 |
| 9.551389363777778 | -0.14 |
| 9.55448259625 | -0.14 |
| 9.557565272583332 | -0.14 |
| 9.56072239761111 | -0.14 |
| 9.563802018194444 | -0.14 |
| 9.566898584194446 | -0.13 |
| 9.569966537444444 | -0.13 |
| 9.573054769638889 | -0.13 |
| 9.576126889805556 | -0.14 |
| 9.57918900938889 | -0.15 |
| 9.582251684555557 | -0.15 |
| 9.585349083944445 | -0.16 |
| 9.588429537916666 | -0.15 |
| 9.5915011025 | -0.16 |
| 9.594596557305556 | -0.16 |
| 9.597667566305557 | -0.16 |
| 9.600730519277779 | -0.15 |
| 9.603807361916667 | -0.15 |
| 9.606903372333333 | -0.17 |
| 9.609994938055555 | -0.16 |
| 9.613071780694446 | -0.16 |
| 9.616161679666666 | -0.14 |
| 9.619232410861112 | -0.15 |
| 9.622309253500001 | -0.15 |
| 9.625376928972223 | -0.14 |
| 9.628436826194445 | -0.12 |
| 9.631500334750001 | -0.13 |
| 9.63457551063889 | -0.12 |
| 9.637674021194444 | -0.12 |
| 9.640741141083332 | -0.14 |
| 9.643819928277777 | -0.14 |
| 9.646889826083333 | -0.11 |
| 9.649956112583334 | -0.12 |
| 9.653035733166666 | -0.13 |
| 9.6561184095 | -0.12 |
| 9.659181362472223 | -0.11 |
| 9.662267372305555 | -0.14 |
| 9.665346159527779 | -0.15 |
| 9.668433836111111 | -0.15 |
| 9.671518457 | -0.14 |
| 9.674589743777778 | -0.14 |
| 9.67768380963889 | -0.13 |
| 9.680767041527776 | -0.14 |
| 9.683843884194443 | -0.14 |
| 9.686909615111112 | -0.14 |
| 9.689974234833333 | -0.14 |
| 9.693049410722223 | -0.15 |
| 9.696256816388889 | -0.14 |
| 9.699333659055556 | -0.13 |
| 9.702404668027777 | -0.14 |
| 9.705469565555555 | -0.12 |
| 9.70853140736111 | -0.11 |
| 9.711613528083333 | -0.13 |
| 9.714675092083334 | -0.1 |
| 9.717745545472221 | -0.13 |
| 9.720829888555555 | -0.11 |
| 9.723894786083333 | -0.11 |
| 9.726979962555555 | -0.11 |
| 9.730065416805555 | -0.11 |
| 9.733126980805554 | -0.12 |
| 9.736191044944444 | -0.11 |
| 9.73925288675 | -0.11 |
| 9.742315839722222 | -0.1 |
| 9.745390460000001 | -0.11 |
| 9.748453690777778 | -0.11 |
| 9.751559701749999 | -0.1 |
| 9.75463876675 | -0.09 |
| 9.757724776611111 | -0.09 |
| 9.760788840750001 | -0.08 |
| 9.763862627666667 | -0.11 |
| 9.766923913888888 | -0.11 |
| 9.770004090055556 | -0.1 |
| 9.773064265083333 | -0.09 |
| 9.776173887388888 | -0.08 |
| 9.779247396527778 | -0.07 |
| 9.782339240027778 | -0.06 |
| 9.785411360194445 | -0.1 |
| 9.788500703555556 | -0.08 |
| 9.791564212111112 | -0.09 |
| 9.794636332277777 | -0.1 |
| 9.797717619611111 | -0.08 |
| 9.800781405972222 | -0.08 |
| 9.803859637583333 | -0.09 |
| 9.806928424222221 | -0.07 |
| 9.809991099388888 | -0.07 |
| 9.813065164111112 | -0.08 |
| 9.816129783833334 | -0.1 |
| 9.8192066265 | -0.09 |
| 9.822285969305556 | -0.08 |
| 9.825370034583333 | -0.1 |
| 9.828432709749999 | -0.08 |
| 9.831496218305555 | -0.09 |
| 9.83456056025 | -0.08 |
| 9.837644625527778 | -0.08 |
| 9.840729246416668 | -0.09 |
| 9.843799977611111 | -0.1 |
| 9.846888209805556 | -0.08 |
| 9.849964774666665 | -0.13 |
| 9.853032727916666 | -0.1 |
| 9.856123182444444 | -0.11 |
| 9.859185024250001 | -0.11 |
| 9.86226492263889 | -0.06 |
| 9.865335098222221 | -0.07 |
| 9.868407496194443 | -0.06 |
| 9.871471560333333 | -0.08 |
| 9.874569793083333 | -0.09 |
| 9.877653024999999 | -0.09 |
| 9.880766536416665 | -0.1 |
| 9.883838656583332 | -0.11 |
| 9.886902442916668 | -0.11 |
| 9.889968729416667 | -0.11 |
| 9.893032793555555 | -0.12 |
| 9.896444377583332 | -0.13 |
| 9.899503719222222 | -0.11 |
| 9.90256306088889 | -0.12 |